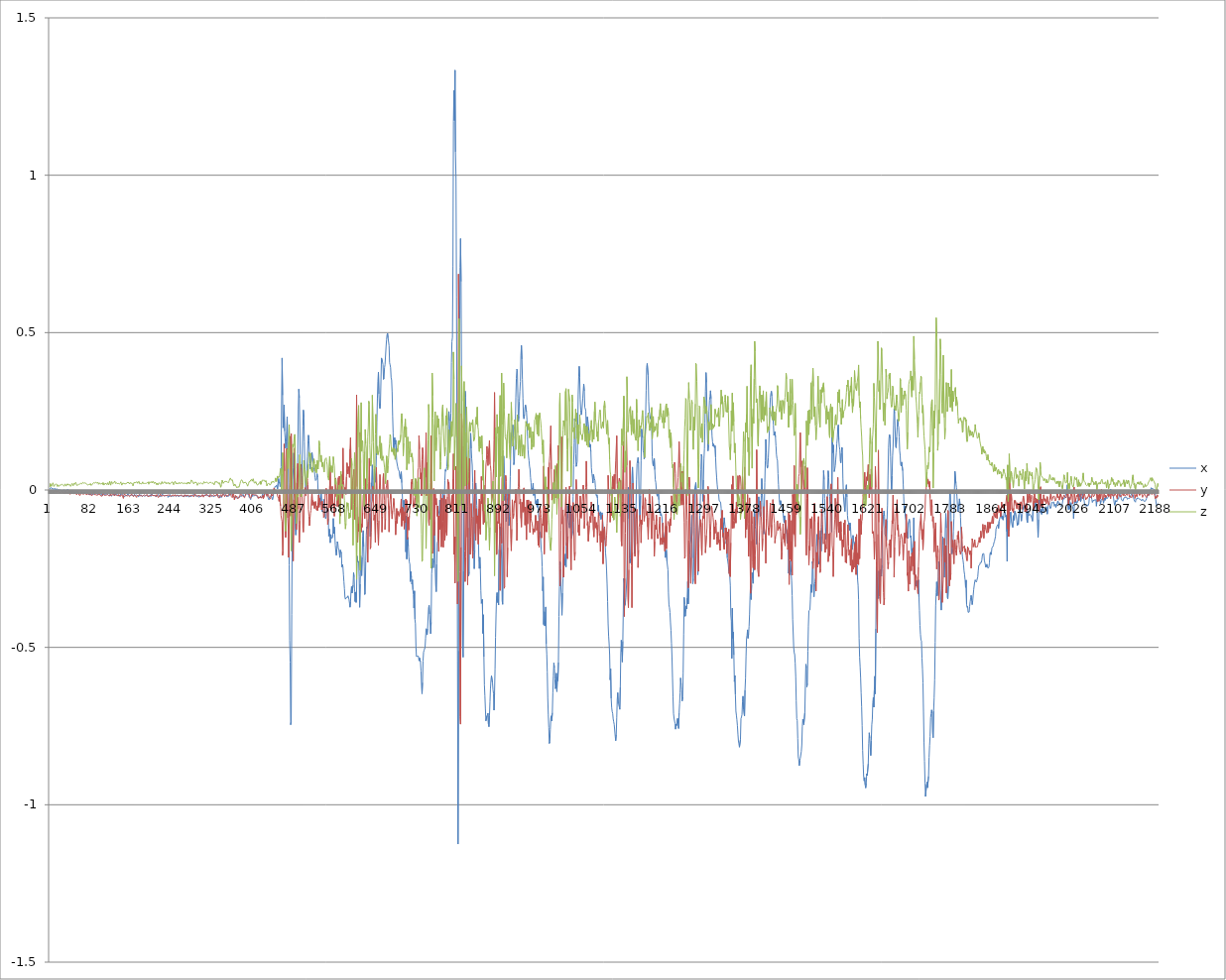
| Category | x | y | z |
|---|---|---|---|
| 0 | 0.003 | -0.001 | 0.009 |
| 1 | 0.007 | 0 | 0.02 |
| 2 | 0.005 | -0.003 | 0.019 |
| 3 | 0.007 | -0.004 | 0.012 |
| 4 | 0.007 | -0.005 | 0.015 |
| 5 | 0.003 | -0.007 | 0.018 |
| 6 | 0.004 | -0.008 | 0.023 |
| 7 | 0.004 | -0.005 | 0.022 |
| 8 | 0.002 | -0.006 | 0.011 |
| 9 | 0.003 | -0.003 | 0.013 |
| 10 | 0.004 | -0.004 | 0.017 |
| 11 | 0.005 | -0.005 | 0.017 |
| 12 | 0 | -0.002 | 0.019 |
| 13 | 0.002 | -0.006 | 0.02 |
| 14 | 0.004 | -0.006 | 0.017 |
| 15 | 0.001 | -0.005 | 0.011 |
| 16 | 0.001 | -0.008 | 0.016 |
| 17 | -0.004 | -0.005 | 0.016 |
| 18 | 0 | -0.006 | 0.012 |
| 19 | 0.001 | -0.009 | 0.013 |
| 20 | 0 | -0.007 | 0.016 |
| 21 | 0.001 | -0.008 | 0.014 |
| 22 | -0.002 | -0.009 | 0.016 |
| 23 | -0.003 | -0.005 | 0.017 |
| 24 | -0.002 | -0.003 | 0.018 |
| 25 | -0.001 | -0.007 | 0.018 |
| 26 | -0.003 | -0.009 | 0.015 |
| 27 | 0 | -0.009 | 0.014 |
| 28 | 0.001 | -0.008 | 0.012 |
| 29 | -0.001 | -0.011 | 0.013 |
| 30 | -0.008 | -0.012 | 0.019 |
| 31 | -0.007 | -0.007 | 0.02 |
| 32 | -0.002 | -0.009 | 0.012 |
| 33 | 0 | -0.008 | 0.015 |
| 34 | -0.002 | -0.008 | 0.019 |
| 35 | 0.002 | -0.009 | 0.015 |
| 36 | -0.002 | -0.009 | 0.019 |
| 37 | -0.004 | -0.009 | 0.02 |
| 38 | -0.005 | -0.009 | 0.015 |
| 39 | -0.006 | -0.008 | 0.018 |
| 40 | -0.005 | -0.014 | 0.017 |
| 41 | -0.002 | -0.012 | 0.012 |
| 42 | -0.001 | -0.009 | 0.014 |
| 43 | -0.002 | -0.009 | 0.018 |
| 44 | -0.003 | -0.006 | 0.021 |
| 45 | -0.001 | -0.005 | 0.019 |
| 46 | -0.004 | -0.008 | 0.013 |
| 47 | -0.009 | -0.012 | 0.017 |
| 48 | -0.006 | -0.013 | 0.021 |
| 49 | -0.008 | -0.011 | 0.018 |
| 50 | -0.009 | -0.01 | 0.016 |
| 51 | -0.008 | -0.011 | 0.024 |
| 52 | -0.01 | -0.012 | 0.02 |
| 53 | -0.007 | -0.015 | 0.015 |
| 54 | -0.003 | -0.012 | 0.016 |
| 55 | -0.008 | -0.01 | 0.016 |
| 56 | -0.011 | -0.01 | 0.015 |
| 57 | -0.009 | -0.013 | 0.018 |
| 58 | -0.009 | -0.016 | 0.019 |
| 59 | -0.01 | -0.014 | 0.019 |
| 60 | -0.01 | -0.017 | 0.02 |
| 61 | -0.011 | -0.012 | 0.021 |
| 62 | -0.005 | -0.007 | 0.024 |
| 63 | -0.006 | -0.01 | 0.019 |
| 64 | -0.01 | -0.011 | 0.02 |
| 65 | -0.01 | -0.013 | 0.024 |
| 66 | -0.009 | -0.015 | 0.023 |
| 67 | -0.01 | -0.014 | 0.022 |
| 68 | -0.008 | -0.011 | 0.023 |
| 69 | -0.007 | -0.011 | 0.023 |
| 70 | -0.008 | -0.012 | 0.021 |
| 71 | -0.01 | -0.015 | 0.022 |
| 72 | -0.01 | -0.014 | 0.022 |
| 73 | -0.009 | -0.015 | 0.018 |
| 74 | -0.007 | -0.014 | 0.016 |
| 75 | -0.011 | -0.011 | 0.016 |
| 76 | -0.014 | -0.013 | 0.018 |
| 77 | -0.013 | -0.014 | 0.017 |
| 78 | -0.013 | -0.015 | 0.014 |
| 79 | -0.012 | -0.015 | 0.017 |
| 80 | -0.015 | -0.013 | 0.021 |
| 81 | -0.01 | -0.014 | 0.015 |
| 82 | -0.01 | -0.018 | 0.015 |
| 83 | -0.015 | -0.017 | 0.016 |
| 84 | -0.012 | -0.017 | 0.019 |
| 85 | -0.011 | -0.013 | 0.021 |
| 86 | -0.013 | -0.011 | 0.024 |
| 87 | -0.014 | -0.01 | 0.023 |
| 88 | -0.013 | -0.012 | 0.021 |
| 89 | -0.01 | -0.015 | 0.022 |
| 90 | -0.009 | -0.012 | 0.022 |
| 91 | -0.01 | -0.015 | 0.025 |
| 92 | -0.011 | -0.015 | 0.023 |
| 93 | -0.011 | -0.017 | 0.022 |
| 94 | -0.015 | -0.014 | 0.024 |
| 95 | -0.013 | -0.015 | 0.024 |
| 96 | -0.01 | -0.018 | 0.018 |
| 97 | -0.011 | -0.014 | 0.018 |
| 98 | -0.012 | -0.013 | 0.023 |
| 99 | -0.01 | -0.015 | 0.02 |
| 100 | -0.013 | -0.014 | 0.018 |
| 101 | -0.015 | -0.02 | 0.018 |
| 102 | -0.013 | -0.018 | 0.022 |
| 103 | -0.016 | -0.019 | 0.021 |
| 104 | -0.019 | -0.016 | 0.018 |
| 105 | -0.016 | -0.011 | 0.023 |
| 106 | -0.011 | -0.014 | 0.017 |
| 107 | -0.013 | -0.014 | 0.014 |
| 108 | -0.015 | -0.017 | 0.017 |
| 109 | -0.016 | -0.016 | 0.022 |
| 110 | -0.014 | -0.017 | 0.024 |
| 111 | -0.014 | -0.018 | 0.02 |
| 112 | -0.013 | -0.016 | 0.018 |
| 113 | -0.016 | -0.013 | 0.017 |
| 114 | -0.014 | -0.015 | 0.023 |
| 115 | -0.012 | -0.016 | 0.019 |
| 116 | -0.017 | -0.018 | 0.016 |
| 117 | -0.019 | -0.02 | 0.019 |
| 118 | -0.018 | -0.019 | 0.028 |
| 119 | -0.014 | -0.015 | 0.021 |
| 120 | -0.015 | -0.011 | 0.015 |
| 121 | -0.02 | -0.018 | 0.018 |
| 122 | -0.017 | -0.02 | 0.027 |
| 123 | -0.018 | -0.014 | 0.024 |
| 124 | -0.017 | -0.011 | 0.02 |
| 125 | -0.014 | -0.011 | 0.02 |
| 126 | -0.012 | -0.015 | 0.023 |
| 127 | -0.012 | -0.019 | 0.024 |
| 128 | -0.016 | -0.019 | 0.028 |
| 129 | -0.015 | -0.014 | 0.024 |
| 130 | -0.015 | -0.015 | 0.02 |
| 131 | -0.016 | -0.017 | 0.024 |
| 132 | -0.014 | -0.016 | 0.026 |
| 133 | -0.013 | -0.017 | 0.02 |
| 134 | -0.016 | -0.019 | 0.019 |
| 135 | -0.018 | -0.019 | 0.021 |
| 136 | -0.016 | -0.014 | 0.023 |
| 137 | -0.015 | -0.012 | 0.019 |
| 138 | -0.02 | -0.018 | 0.018 |
| 139 | -0.018 | -0.019 | 0.022 |
| 140 | -0.012 | -0.019 | 0.026 |
| 141 | -0.013 | -0.015 | 0.019 |
| 142 | -0.012 | -0.015 | 0.015 |
| 143 | -0.012 | -0.017 | 0.019 |
| 144 | -0.014 | -0.022 | 0.022 |
| 145 | -0.017 | -0.027 | 0.021 |
| 146 | -0.022 | -0.018 | 0.021 |
| 147 | -0.019 | -0.012 | 0.018 |
| 148 | -0.02 | -0.011 | 0.02 |
| 149 | -0.017 | -0.017 | 0.021 |
| 150 | -0.017 | -0.019 | 0.02 |
| 151 | -0.016 | -0.017 | 0.021 |
| 152 | -0.018 | -0.015 | 0.022 |
| 153 | -0.015 | -0.019 | 0.023 |
| 154 | -0.012 | -0.019 | 0.025 |
| 155 | -0.013 | -0.016 | 0.024 |
| 156 | -0.015 | -0.016 | 0.022 |
| 157 | -0.016 | -0.021 | 0.019 |
| 158 | -0.018 | -0.02 | 0.024 |
| 159 | -0.016 | -0.018 | 0.022 |
| 160 | -0.016 | -0.016 | 0.022 |
| 161 | -0.018 | -0.013 | 0.022 |
| 162 | -0.016 | -0.014 | 0.022 |
| 163 | -0.015 | -0.018 | 0.017 |
| 164 | -0.016 | -0.021 | 0.013 |
| 165 | -0.021 | -0.021 | 0.019 |
| 166 | -0.018 | -0.019 | 0.024 |
| 167 | -0.014 | -0.015 | 0.023 |
| 168 | -0.014 | -0.013 | 0.023 |
| 169 | -0.018 | -0.019 | 0.023 |
| 170 | -0.018 | -0.021 | 0.025 |
| 171 | -0.016 | -0.023 | 0.026 |
| 172 | -0.015 | -0.018 | 0.026 |
| 173 | -0.018 | -0.015 | 0.021 |
| 174 | -0.017 | -0.018 | 0.026 |
| 175 | -0.022 | -0.016 | 0.025 |
| 176 | -0.02 | -0.015 | 0.027 |
| 177 | -0.014 | -0.015 | 0.02 |
| 178 | -0.017 | -0.018 | 0.02 |
| 179 | -0.02 | -0.019 | 0.021 |
| 180 | -0.016 | -0.017 | 0.02 |
| 181 | -0.018 | -0.015 | 0.019 |
| 182 | -0.021 | -0.02 | 0.021 |
| 183 | -0.018 | -0.019 | 0.026 |
| 184 | -0.017 | -0.018 | 0.021 |
| 185 | -0.018 | -0.017 | 0.018 |
| 186 | -0.019 | -0.015 | 0.021 |
| 187 | -0.02 | -0.016 | 0.022 |
| 188 | -0.019 | -0.018 | 0.021 |
| 189 | -0.017 | -0.018 | 0.023 |
| 190 | -0.016 | -0.017 | 0.021 |
| 191 | -0.018 | -0.015 | 0.019 |
| 192 | -0.019 | -0.014 | 0.023 |
| 193 | -0.019 | -0.02 | 0.023 |
| 194 | -0.019 | -0.019 | 0.025 |
| 195 | -0.017 | -0.021 | 0.018 |
| 196 | -0.018 | -0.019 | 0.02 |
| 197 | -0.015 | -0.018 | 0.026 |
| 198 | -0.015 | -0.016 | 0.024 |
| 199 | -0.021 | -0.016 | 0.023 |
| 200 | -0.017 | -0.016 | 0.026 |
| 201 | -0.013 | -0.015 | 0.027 |
| 202 | -0.016 | -0.015 | 0.022 |
| 203 | -0.018 | -0.017 | 0.025 |
| 204 | -0.018 | -0.015 | 0.027 |
| 205 | -0.018 | -0.018 | 0.027 |
| 206 | -0.017 | -0.018 | 0.021 |
| 207 | -0.018 | -0.018 | 0.024 |
| 208 | -0.017 | -0.019 | 0.027 |
| 209 | -0.016 | -0.021 | 0.023 |
| 210 | -0.022 | -0.021 | 0.017 |
| 211 | -0.02 | -0.014 | 0.022 |
| 212 | -0.017 | -0.016 | 0.021 |
| 213 | -0.017 | -0.021 | 0.016 |
| 214 | -0.014 | -0.024 | 0.017 |
| 215 | -0.018 | -0.022 | 0.023 |
| 216 | -0.02 | -0.019 | 0.022 |
| 217 | -0.022 | -0.017 | 0.02 |
| 218 | -0.017 | -0.013 | 0.02 |
| 219 | -0.017 | -0.014 | 0.018 |
| 220 | -0.02 | -0.02 | 0.022 |
| 221 | -0.017 | -0.022 | 0.027 |
| 222 | -0.013 | -0.018 | 0.021 |
| 223 | -0.014 | -0.018 | 0.018 |
| 224 | -0.017 | -0.017 | 0.021 |
| 225 | -0.02 | -0.018 | 0.023 |
| 226 | -0.018 | -0.019 | 0.026 |
| 227 | -0.018 | -0.018 | 0.025 |
| 228 | -0.018 | -0.017 | 0.023 |
| 229 | -0.018 | -0.02 | 0.02 |
| 230 | -0.017 | -0.018 | 0.024 |
| 231 | -0.014 | -0.015 | 0.027 |
| 232 | -0.017 | -0.017 | 0.02 |
| 233 | -0.023 | -0.018 | 0.019 |
| 234 | -0.02 | -0.016 | 0.024 |
| 235 | -0.019 | -0.015 | 0.024 |
| 236 | -0.021 | -0.017 | 0.018 |
| 237 | -0.014 | -0.018 | 0.019 |
| 238 | -0.015 | -0.019 | 0.021 |
| 239 | -0.021 | -0.02 | 0.021 |
| 240 | -0.019 | -0.019 | 0.024 |
| 241 | -0.019 | -0.017 | 0.027 |
| 242 | -0.021 | -0.015 | 0.026 |
| 243 | -0.019 | -0.018 | 0.022 |
| 244 | -0.017 | -0.017 | 0.017 |
| 245 | -0.018 | -0.018 | 0.021 |
| 246 | -0.018 | -0.02 | 0.024 |
| 247 | -0.018 | -0.015 | 0.028 |
| 248 | -0.016 | -0.012 | 0.027 |
| 249 | -0.021 | -0.019 | 0.019 |
| 250 | -0.02 | -0.019 | 0.023 |
| 251 | -0.016 | -0.018 | 0.025 |
| 252 | -0.013 | -0.018 | 0.02 |
| 253 | -0.017 | -0.018 | 0.019 |
| 254 | -0.022 | -0.02 | 0.021 |
| 255 | -0.021 | -0.018 | 0.025 |
| 256 | -0.018 | -0.019 | 0.02 |
| 257 | -0.02 | -0.018 | 0.018 |
| 258 | -0.019 | -0.015 | 0.022 |
| 259 | -0.02 | -0.016 | 0.022 |
| 260 | -0.018 | -0.018 | 0.024 |
| 261 | -0.017 | -0.017 | 0.027 |
| 262 | -0.019 | -0.018 | 0.021 |
| 263 | -0.02 | -0.022 | 0.019 |
| 264 | -0.022 | -0.023 | 0.022 |
| 265 | -0.016 | -0.019 | 0.024 |
| 266 | -0.015 | -0.015 | 0.021 |
| 267 | -0.02 | -0.017 | 0.02 |
| 268 | -0.019 | -0.02 | 0.021 |
| 269 | -0.015 | -0.017 | 0.02 |
| 270 | -0.021 | -0.018 | 0.019 |
| 271 | -0.023 | -0.018 | 0.022 |
| 272 | -0.016 | -0.017 | 0.025 |
| 273 | -0.016 | -0.016 | 0.021 |
| 274 | -0.023 | -0.019 | 0.025 |
| 275 | -0.018 | -0.021 | 0.024 |
| 276 | -0.017 | -0.019 | 0.019 |
| 277 | -0.018 | -0.02 | 0.021 |
| 278 | -0.019 | -0.017 | 0.026 |
| 279 | -0.021 | -0.016 | 0.032 |
| 280 | -0.021 | -0.013 | 0.032 |
| 281 | -0.017 | -0.017 | 0.029 |
| 282 | -0.014 | -0.017 | 0.023 |
| 283 | -0.015 | -0.018 | 0.023 |
| 284 | -0.016 | -0.022 | 0.019 |
| 285 | -0.016 | -0.02 | 0.025 |
| 286 | -0.017 | -0.012 | 0.027 |
| 287 | -0.019 | -0.01 | 0.024 |
| 288 | -0.019 | -0.017 | 0.021 |
| 289 | -0.019 | -0.017 | 0.024 |
| 290 | -0.018 | -0.019 | 0.02 |
| 291 | -0.018 | -0.021 | 0.015 |
| 292 | -0.02 | -0.02 | 0.019 |
| 293 | -0.021 | -0.016 | 0.021 |
| 294 | -0.021 | -0.015 | 0.023 |
| 295 | -0.023 | -0.019 | 0.022 |
| 296 | -0.019 | -0.018 | 0.02 |
| 297 | -0.019 | -0.019 | 0.019 |
| 298 | -0.019 | -0.019 | 0.023 |
| 299 | -0.017 | -0.021 | 0.023 |
| 300 | -0.018 | -0.021 | 0.02 |
| 301 | -0.02 | -0.014 | 0.021 |
| 302 | -0.017 | -0.018 | 0.019 |
| 303 | -0.016 | -0.023 | 0.018 |
| 304 | -0.019 | -0.017 | 0.027 |
| 305 | -0.019 | -0.016 | 0.026 |
| 306 | -0.015 | -0.017 | 0.022 |
| 307 | -0.015 | -0.02 | 0.023 |
| 308 | -0.017 | -0.017 | 0.024 |
| 309 | -0.015 | -0.012 | 0.026 |
| 310 | -0.018 | -0.014 | 0.025 |
| 311 | -0.021 | -0.016 | 0.024 |
| 312 | -0.018 | -0.017 | 0.022 |
| 313 | -0.016 | -0.02 | 0.019 |
| 314 | -0.018 | -0.02 | 0.021 |
| 315 | -0.02 | -0.022 | 0.023 |
| 316 | -0.022 | -0.014 | 0.025 |
| 317 | -0.019 | -0.013 | 0.022 |
| 318 | -0.017 | -0.016 | 0.024 |
| 319 | -0.017 | -0.019 | 0.025 |
| 320 | -0.016 | -0.021 | 0.021 |
| 321 | -0.019 | -0.021 | 0.023 |
| 322 | -0.02 | -0.017 | 0.023 |
| 323 | -0.022 | -0.017 | 0.022 |
| 324 | -0.021 | -0.015 | 0.016 |
| 325 | -0.022 | -0.018 | 0.02 |
| 326 | -0.018 | -0.019 | 0.027 |
| 327 | -0.015 | -0.02 | 0.028 |
| 328 | -0.014 | -0.018 | 0.025 |
| 329 | -0.017 | -0.016 | 0.027 |
| 330 | -0.017 | -0.011 | 0.026 |
| 331 | -0.02 | -0.016 | 0.023 |
| 332 | -0.019 | -0.024 | 0.021 |
| 333 | -0.017 | -0.026 | 0.02 |
| 334 | -0.021 | -0.025 | 0.024 |
| 335 | -0.026 | -0.02 | 0.027 |
| 336 | -0.019 | -0.016 | 0.015 |
| 337 | -0.019 | -0.016 | 0.009 |
| 338 | -0.024 | -0.016 | 0.015 |
| 339 | -0.023 | -0.022 | 0.027 |
| 340 | -0.017 | -0.019 | 0.032 |
| 341 | -0.014 | -0.007 | 0.03 |
| 342 | -0.015 | -0.013 | 0.021 |
| 343 | -0.016 | -0.015 | 0.024 |
| 344 | -0.015 | -0.017 | 0.026 |
| 345 | -0.014 | -0.021 | 0.025 |
| 346 | -0.016 | -0.016 | 0.027 |
| 347 | -0.016 | -0.013 | 0.026 |
| 348 | -0.017 | -0.015 | 0.027 |
| 349 | -0.022 | -0.017 | 0.024 |
| 350 | -0.018 | -0.019 | 0.026 |
| 351 | -0.017 | -0.018 | 0.025 |
| 352 | -0.019 | -0.018 | 0.023 |
| 353 | -0.021 | -0.019 | 0.027 |
| 354 | -0.018 | -0.01 | 0.031 |
| 355 | -0.011 | -0.005 | 0.032 |
| 356 | -0.005 | -0.007 | 0.038 |
| 357 | -0.008 | -0.016 | 0.035 |
| 358 | -0.011 | -0.02 | 0.031 |
| 359 | -0.014 | -0.019 | 0.03 |
| 360 | -0.015 | -0.024 | 0.032 |
| 361 | -0.02 | -0.008 | 0.031 |
| 362 | -0.019 | -0.005 | 0.018 |
| 363 | -0.021 | -0.022 | 0.013 |
| 364 | -0.023 | -0.031 | 0.014 |
| 365 | -0.027 | -0.022 | 0.019 |
| 366 | -0.022 | -0.017 | 0.016 |
| 367 | -0.022 | -0.023 | 0.013 |
| 368 | -0.024 | -0.021 | 0.012 |
| 369 | -0.027 | -0.02 | 0.007 |
| 370 | -0.026 | -0.027 | 0.009 |
| 371 | -0.025 | -0.026 | 0.011 |
| 372 | -0.025 | -0.026 | 0.012 |
| 373 | -0.022 | -0.026 | 0.009 |
| 374 | -0.02 | -0.024 | 0.012 |
| 375 | -0.017 | -0.017 | 0.02 |
| 376 | -0.017 | -0.009 | 0.027 |
| 377 | -0.021 | -0.011 | 0.03 |
| 378 | -0.018 | -0.017 | 0.032 |
| 379 | -0.018 | -0.018 | 0.031 |
| 380 | -0.018 | -0.018 | 0.029 |
| 381 | -0.014 | -0.019 | 0.022 |
| 382 | -0.015 | -0.022 | 0.023 |
| 383 | -0.022 | -0.023 | 0.023 |
| 384 | -0.02 | -0.024 | 0.021 |
| 385 | -0.018 | -0.02 | 0.025 |
| 386 | -0.017 | -0.013 | 0.025 |
| 387 | -0.013 | -0.012 | 0.023 |
| 388 | -0.005 | -0.012 | 0.023 |
| 389 | -0.008 | -0.008 | 0.017 |
| 390 | -0.013 | -0.007 | 0.012 |
| 391 | -0.015 | -0.014 | 0.011 |
| 392 | -0.017 | -0.013 | 0.021 |
| 393 | -0.023 | -0.011 | 0.026 |
| 394 | -0.025 | -0.019 | 0.027 |
| 395 | -0.026 | -0.026 | 0.027 |
| 396 | -0.03 | -0.029 | 0.032 |
| 397 | -0.029 | -0.024 | 0.034 |
| 398 | -0.018 | -0.014 | 0.034 |
| 399 | -0.014 | -0.013 | 0.028 |
| 400 | -0.021 | -0.014 | 0.032 |
| 401 | -0.022 | -0.013 | 0.036 |
| 402 | -0.017 | -0.014 | 0.033 |
| 403 | -0.018 | -0.011 | 0.023 |
| 404 | -0.018 | -0.016 | 0.02 |
| 405 | -0.016 | -0.017 | 0.023 |
| 406 | -0.016 | -0.016 | 0.027 |
| 407 | -0.018 | -0.017 | 0.024 |
| 408 | -0.018 | -0.016 | 0.018 |
| 409 | -0.021 | -0.016 | 0.018 |
| 410 | -0.024 | -0.019 | 0.015 |
| 411 | -0.024 | -0.027 | 0.015 |
| 412 | -0.025 | -0.023 | 0.021 |
| 413 | -0.026 | -0.022 | 0.023 |
| 414 | -0.024 | -0.025 | 0.023 |
| 415 | -0.021 | -0.02 | 0.028 |
| 416 | -0.023 | -0.022 | 0.018 |
| 417 | -0.024 | -0.026 | 0.019 |
| 418 | -0.024 | -0.026 | 0.028 |
| 419 | -0.015 | -0.022 | 0.031 |
| 420 | -0.012 | -0.017 | 0.03 |
| 421 | -0.023 | -0.028 | 0.031 |
| 422 | -0.023 | -0.029 | 0.031 |
| 423 | -0.016 | -0.016 | 0.031 |
| 424 | -0.014 | -0.004 | 0.03 |
| 425 | -0.01 | -0.001 | 0.025 |
| 426 | -0.006 | -0.005 | 0.03 |
| 427 | -0.005 | -0.016 | 0.025 |
| 428 | -0.005 | -0.02 | 0.013 |
| 429 | -0.013 | -0.01 | 0.018 |
| 430 | -0.023 | -0.011 | 0.021 |
| 431 | -0.028 | -0.015 | 0.021 |
| 432 | -0.031 | -0.022 | 0.022 |
| 433 | -0.028 | -0.022 | 0.02 |
| 434 | -0.024 | -0.025 | 0.015 |
| 435 | -0.022 | -0.029 | 0.014 |
| 436 | -0.018 | -0.023 | 0.019 |
| 437 | -0.018 | -0.011 | 0.026 |
| 438 | -0.023 | -0.009 | 0.023 |
| 439 | -0.031 | -0.019 | 0.025 |
| 440 | -0.027 | -0.015 | 0.028 |
| 441 | -0.013 | -0.003 | 0.028 |
| 442 | -0.001 | 0.007 | 0.024 |
| 443 | 0.005 | 0.004 | 0.022 |
| 444 | 0.011 | 0 | 0.027 |
| 445 | 0.013 | -0.005 | 0.038 |
| 446 | 0.011 | -0.007 | 0.037 |
| 447 | 0.015 | -0.003 | 0.027 |
| 448 | 0.012 | -0.007 | 0.03 |
| 449 | 0.003 | -0.019 | 0.044 |
| 450 | 0.021 | -0.019 | 0.038 |
| 451 | 0.036 | -0.027 | 0.038 |
| 452 | 0.021 | -0.036 | 0.041 |
| 453 | 0.025 | -0.015 | 0.044 |
| 454 | 0.011 | -0.018 | 0.057 |
| 455 | 0.014 | -0.051 | 0.068 |
| 456 | 0.075 | -0.081 | 0.048 |
| 457 | 0.271 | -0.092 | -0.002 |
| 458 | 0.419 | -0.1 | 0.053 |
| 459 | 0.301 | -0.208 | 0.119 |
| 460 | 0.198 | -0.194 | 0.073 |
| 461 | 0.232 | -0.004 | -0.015 |
| 462 | 0.27 | 0.146 | -0.047 |
| 463 | 0.187 | 0.06 | -0.062 |
| 464 | 0.164 | -0.112 | -0.107 |
| 465 | 0.133 | -0.151 | -0.131 |
| 466 | 0.153 | -0.105 | -0.058 |
| 467 | 0.188 | 0.132 | 0.015 |
| 468 | 0.233 | 0.131 | 0.129 |
| 469 | 0.13 | -0.089 | 0.111 |
| 470 | 0.102 | -0.117 | 0.068 |
| 471 | 0.002 | -0.214 | 0.152 |
| 472 | -0.239 | -0.076 | 0.208 |
| 473 | -0.478 | 0.024 | 0.101 |
| 474 | -0.547 | 0.171 | 0.012 |
| 475 | -0.746 | -0.083 | 0.015 |
| 476 | -0.736 | 0.179 | -0.194 |
| 477 | -0.396 | 0.08 | -0.083 |
| 478 | -0.125 | -0.077 | 0.062 |
| 479 | 0.032 | -0.099 | 0.145 |
| 480 | 0.07 | -0.226 | 0.137 |
| 481 | 0.118 | -0.03 | 0.147 |
| 482 | 0.047 | -0.001 | 0.172 |
| 483 | -0.009 | 0.134 | 0.177 |
| 484 | -0.126 | -0.064 | 0.069 |
| 485 | -0.143 | -0.037 | -0.058 |
| 486 | -0.126 | -0.126 | -0.107 |
| 487 | -0.089 | 0.023 | -0.06 |
| 488 | -0.029 | 0.023 | -0.015 |
| 489 | 0.115 | 0.084 | -0.022 |
| 490 | 0.255 | -0.06 | -0.018 |
| 491 | 0.321 | -0.109 | 0.009 |
| 492 | 0.293 | -0.167 | 0.083 |
| 493 | 0.202 | -0.098 | 0.112 |
| 494 | 0.064 | -0.009 | 0.069 |
| 495 | 0.002 | 0.082 | 0.021 |
| 496 | 0 | 0.064 | -0.022 |
| 497 | 0.045 | 0.023 | -0.007 |
| 498 | 0.129 | -0.058 | -0.004 |
| 499 | 0.204 | -0.121 | 0.004 |
| 500 | 0.254 | -0.134 | 0.053 |
| 501 | 0.231 | -0.063 | 0.094 |
| 502 | 0.153 | -0.023 | 0.095 |
| 503 | 0.065 | 0.007 | 0.045 |
| 504 | 0.007 | -0.002 | 0.025 |
| 505 | -0.019 | -0.019 | 0.018 |
| 506 | 0.004 | 0.001 | 0.014 |
| 507 | 0.069 | 0.041 | 0.061 |
| 508 | 0.105 | 0.031 | 0.063 |
| 509 | 0.148 | 0.016 | 0.04 |
| 510 | 0.174 | -0.061 | 0.083 |
| 511 | 0.156 | -0.084 | 0.12 |
| 512 | 0.12 | -0.113 | 0.107 |
| 513 | 0.084 | -0.093 | 0.108 |
| 514 | 0.067 | -0.074 | 0.117 |
| 515 | 0.077 | -0.065 | 0.082 |
| 516 | 0.104 | -0.026 | 0.062 |
| 517 | 0.12 | -0.009 | 0.071 |
| 518 | 0.122 | -0.049 | 0.056 |
| 519 | 0.083 | -0.034 | 0.054 |
| 520 | 0.072 | -0.047 | 0.092 |
| 521 | 0.064 | -0.039 | 0.099 |
| 522 | 0.058 | -0.058 | 0.085 |
| 523 | 0.04 | -0.059 | 0.059 |
| 524 | 0.03 | -0.037 | 0.081 |
| 525 | 0.029 | -0.05 | 0.072 |
| 526 | 0.034 | -0.064 | 0.054 |
| 527 | 0.052 | -0.052 | 0.094 |
| 528 | 0.04 | -0.066 | 0.094 |
| 529 | -0.004 | -0.039 | 0.066 |
| 530 | -0.001 | -0.016 | 0.095 |
| 531 | -0.003 | -0.055 | 0.156 |
| 532 | -0.037 | -0.027 | 0.142 |
| 533 | -0.048 | -0.036 | 0.112 |
| 534 | -0.035 | -0.038 | 0.09 |
| 535 | -0.009 | -0.041 | 0.111 |
| 536 | -0.039 | -0.063 | 0.109 |
| 537 | -0.069 | -0.035 | 0.074 |
| 538 | -0.06 | -0.049 | 0.088 |
| 539 | -0.051 | -0.053 | 0.077 |
| 540 | -0.03 | -0.087 | 0.066 |
| 541 | -0.036 | -0.084 | 0.057 |
| 542 | -0.065 | -0.065 | 0.091 |
| 543 | -0.087 | -0.011 | 0.098 |
| 544 | -0.091 | -0.008 | 0.099 |
| 545 | -0.084 | 0.005 | 0.102 |
| 546 | -0.05 | -0.018 | 0.09 |
| 547 | -0.071 | -0.071 | 0.079 |
| 548 | -0.059 | -0.109 | 0.044 |
| 549 | -0.068 | -0.092 | 0.047 |
| 550 | -0.147 | -0.005 | 0.031 |
| 551 | -0.124 | -0.056 | 0.034 |
| 552 | -0.137 | 0.015 | 0.107 |
| 553 | -0.168 | 0.072 | 0.075 |
| 554 | -0.141 | -0.052 | 0.057 |
| 555 | -0.146 | -0.066 | 0.077 |
| 556 | -0.154 | -0.012 | 0.064 |
| 557 | -0.156 | 0.011 | 0.055 |
| 558 | -0.15 | -0.048 | 0.068 |
| 559 | -0.09 | -0.042 | 0.106 |
| 560 | -0.138 | -0.052 | 0.089 |
| 561 | -0.118 | -0.083 | 0.076 |
| 562 | -0.142 | -0.023 | 0.04 |
| 563 | -0.175 | 0.038 | 0.018 |
| 564 | -0.196 | -0.002 | 0.035 |
| 565 | -0.207 | -0.021 | 0.017 |
| 566 | -0.188 | 0.003 | -0.033 |
| 567 | -0.164 | -0.052 | -0.019 |
| 568 | -0.17 | 0.004 | -0.006 |
| 569 | -0.186 | 0.039 | -0.016 |
| 570 | -0.19 | -0.051 | 0.016 |
| 571 | -0.191 | 0.044 | -0.002 |
| 572 | -0.215 | 0.033 | -0.108 |
| 573 | -0.191 | -0.083 | 0.022 |
| 574 | -0.19 | 0.002 | 0.06 |
| 575 | -0.201 | 0.018 | 0.021 |
| 576 | -0.245 | 0.048 | 0.012 |
| 577 | -0.237 | -0.026 | 0.017 |
| 578 | -0.244 | 0.133 | 0.001 |
| 579 | -0.269 | 0.031 | -0.006 |
| 580 | -0.291 | 0.015 | -0.011 |
| 581 | -0.314 | -0.005 | -0.034 |
| 582 | -0.341 | 0.008 | -0.103 |
| 583 | -0.347 | -0.009 | -0.124 |
| 584 | -0.349 | -0.014 | -0.107 |
| 585 | -0.341 | 0.042 | -0.062 |
| 586 | -0.34 | 0.086 | -0.04 |
| 587 | -0.341 | 0.069 | -0.051 |
| 588 | -0.336 | 0.051 | -0.042 |
| 589 | -0.338 | 0.074 | -0.068 |
| 590 | -0.347 | 0.06 | -0.091 |
| 591 | -0.36 | 0.04 | -0.074 |
| 592 | -0.372 | 0.131 | -0.088 |
| 593 | -0.354 | 0.166 | -0.077 |
| 594 | -0.322 | 0.07 | 0.005 |
| 595 | -0.307 | 0.012 | 0.1 |
| 596 | -0.327 | -0.062 | 0.078 |
| 597 | -0.329 | 0.031 | -0.089 |
| 598 | -0.302 | 0.043 | -0.176 |
| 599 | -0.262 | 0.05 | -0.046 |
| 600 | -0.276 | 0.066 | 0.046 |
| 601 | -0.323 | -0.04 | 0.119 |
| 602 | -0.354 | -0.094 | 0.075 |
| 603 | -0.324 | 0.009 | -0.08 |
| 604 | -0.357 | 0.129 | -0.158 |
| 605 | -0.316 | 0.302 | -0.284 |
| 606 | -0.21 | 0.01 | -0.054 |
| 607 | -0.228 | -0.167 | 0.209 |
| 608 | -0.228 | -0.107 | 0.236 |
| 609 | -0.226 | -0.131 | 0.269 |
| 610 | -0.275 | -0.084 | 0.136 |
| 611 | -0.373 | -0.011 | -0.224 |
| 612 | -0.299 | 0.183 | -0.255 |
| 613 | -0.209 | 0.087 | 0.171 |
| 614 | -0.247 | -0.134 | 0.278 |
| 615 | -0.272 | -0.108 | 0.123 |
| 616 | -0.213 | -0.118 | 0.157 |
| 617 | -0.146 | -0.072 | 0.153 |
| 618 | -0.129 | -0.016 | 0.115 |
| 619 | -0.18 | -0.013 | 0.011 |
| 620 | -0.243 | -0.024 | -0.053 |
| 621 | -0.332 | -0.091 | 0.122 |
| 622 | -0.326 | -0.046 | 0.192 |
| 623 | -0.225 | 0.036 | 0.148 |
| 624 | -0.143 | 0.003 | 0.132 |
| 625 | -0.117 | -0.064 | -0.005 |
| 626 | -0.122 | -0.181 | 0.02 |
| 627 | -0.112 | -0.23 | 0.169 |
| 628 | -0.094 | -0.1 | 0.201 |
| 629 | -0.096 | 0.028 | 0.282 |
| 630 | -0.09 | 0.101 | 0.273 |
| 631 | -0.074 | -0.039 | 0.143 |
| 632 | -0.148 | -0.187 | 0.095 |
| 633 | -0.088 | -0.181 | 0.076 |
| 634 | 0.023 | -0.133 | 0.094 |
| 635 | 0.012 | -0.041 | 0.15 |
| 636 | 0.08 | -0.035 | 0.301 |
| 637 | 0.032 | 0.012 | 0.298 |
| 638 | -0.019 | -0.018 | 0.154 |
| 639 | 0.015 | -0.096 | 0.085 |
| 640 | 0.066 | -0.097 | 0.002 |
| 641 | 0.047 | -0.079 | 0.076 |
| 642 | 0.025 | -0.167 | 0.178 |
| 643 | 0.052 | -0.014 | 0.241 |
| 644 | 0.109 | 0.071 | 0.189 |
| 645 | 0.216 | -0.011 | 0.116 |
| 646 | 0.293 | -0.103 | 0.139 |
| 647 | 0.346 | -0.143 | 0.112 |
| 648 | 0.374 | -0.176 | 0.109 |
| 649 | 0.305 | -0.098 | 0.125 |
| 650 | 0.265 | 0.013 | 0.146 |
| 651 | 0.259 | 0.049 | 0.171 |
| 652 | 0.277 | 0.013 | 0.1 |
| 653 | 0.35 | -0.04 | 0.119 |
| 654 | 0.419 | -0.069 | 0.149 |
| 655 | 0.421 | -0.134 | 0.094 |
| 656 | 0.407 | -0.084 | 0.105 |
| 657 | 0.399 | 0.036 | 0.108 |
| 658 | 0.352 | 0.052 | 0.1 |
| 659 | 0.355 | -0.006 | 0.097 |
| 660 | 0.389 | -0.032 | 0.072 |
| 661 | 0.398 | -0.126 | 0.056 |
| 662 | 0.396 | -0.09 | 0.02 |
| 663 | 0.454 | 0.006 | 0.019 |
| 664 | 0.477 | 0.013 | 0.108 |
| 665 | 0.493 | 0.027 | 0.103 |
| 666 | 0.497 | 0.032 | 0.054 |
| 667 | 0.483 | -0.025 | 0.076 |
| 668 | 0.484 | -0.064 | 0.102 |
| 669 | 0.458 | -0.133 | 0.129 |
| 670 | 0.405 | -0.051 | 0.147 |
| 671 | 0.398 | -0.053 | 0.176 |
| 672 | 0.388 | -0.009 | 0.17 |
| 673 | 0.357 | -0.028 | 0.142 |
| 674 | 0.35 | -0.077 | 0.122 |
| 675 | 0.312 | -0.092 | 0.128 |
| 676 | 0.236 | -0.065 | 0.122 |
| 677 | 0.18 | -0.054 | 0.134 |
| 678 | 0.121 | -0.027 | 0.114 |
| 679 | 0.15 | -0.034 | 0.109 |
| 680 | 0.167 | -0.07 | 0.131 |
| 681 | 0.146 | -0.096 | 0.097 |
| 682 | 0.158 | -0.142 | 0.107 |
| 683 | 0.123 | -0.096 | 0.114 |
| 684 | 0.091 | -0.059 | 0.122 |
| 685 | 0.082 | -0.105 | 0.132 |
| 686 | 0.074 | -0.067 | 0.122 |
| 687 | 0.065 | -0.079 | 0.154 |
| 688 | 0.062 | -0.076 | 0.157 |
| 689 | 0.06 | -0.083 | 0.144 |
| 690 | 0.043 | -0.07 | 0.157 |
| 691 | 0.036 | -0.061 | 0.154 |
| 692 | 0.05 | -0.072 | 0.175 |
| 693 | 0.058 | -0.028 | 0.229 |
| 694 | 0.023 | -0.115 | 0.243 |
| 695 | -0.012 | -0.055 | 0.211 |
| 696 | -0.05 | -0.097 | 0.179 |
| 697 | -0.079 | -0.056 | 0.109 |
| 698 | -0.033 | -0.095 | 0.148 |
| 699 | -0.048 | -0.124 | 0.201 |
| 700 | -0.068 | -0.069 | 0.192 |
| 701 | -0.073 | -0.104 | 0.225 |
| 702 | -0.197 | -0.029 | 0.167 |
| 703 | -0.083 | -0.053 | 0.199 |
| 704 | -0.219 | -0.034 | 0.064 |
| 705 | -0.163 | -0.157 | 0.081 |
| 706 | -0.151 | -0.086 | 0.168 |
| 707 | -0.179 | -0.109 | 0.131 |
| 708 | -0.212 | -0.127 | 0.084 |
| 709 | -0.23 | -0.081 | 0.125 |
| 710 | -0.236 | -0.069 | 0.154 |
| 711 | -0.291 | -0.011 | 0.122 |
| 712 | -0.259 | -0.045 | 0.104 |
| 713 | -0.278 | 0.025 | 0.113 |
| 714 | -0.299 | 0.034 | 0.117 |
| 715 | -0.285 | 0.018 | 0.118 |
| 716 | -0.317 | -0.032 | 0.087 |
| 717 | -0.332 | -0.055 | 0.03 |
| 718 | -0.375 | -0.043 | -0.016 |
| 719 | -0.321 | -0.052 | 0.004 |
| 720 | -0.411 | -0.024 | -0.018 |
| 721 | -0.425 | 0.008 | 0.036 |
| 722 | -0.498 | 0.034 | 0.004 |
| 723 | -0.529 | 0.022 | -0.053 |
| 724 | -0.527 | -0.046 | -0.082 |
| 725 | -0.528 | -0.034 | -0.002 |
| 726 | -0.526 | 0.063 | 0.03 |
| 727 | -0.528 | 0.07 | 0.039 |
| 728 | -0.543 | 0.173 | -0.057 |
| 729 | -0.533 | 0.13 | -0.054 |
| 730 | -0.531 | 0.071 | -0.052 |
| 731 | -0.546 | 0.035 | -0.048 |
| 732 | -0.575 | 0.054 | -0.073 |
| 733 | -0.621 | -0.018 | -0.14 |
| 734 | -0.647 | 0.096 | -0.227 |
| 735 | -0.612 | 0.134 | -0.22 |
| 736 | -0.544 | 0.116 | -0.117 |
| 737 | -0.516 | 0.059 | -0.032 |
| 738 | -0.51 | -0.013 | 0.05 |
| 739 | -0.507 | -0.004 | 0.07 |
| 740 | -0.5 | 0.067 | 0.008 |
| 741 | -0.471 | 0.041 | -0.03 |
| 742 | -0.441 | 0.182 | -0.186 |
| 743 | -0.451 | -0.019 | -0.053 |
| 744 | -0.46 | 0.024 | -0.05 |
| 745 | -0.44 | 0.087 | -0.064 |
| 746 | -0.403 | 0.008 | 0.158 |
| 747 | -0.374 | -0.099 | 0.272 |
| 748 | -0.366 | -0.112 | 0.231 |
| 749 | -0.394 | 0.002 | 0.024 |
| 750 | -0.394 | -0.069 | -0.066 |
| 751 | -0.457 | -0.094 | -0.076 |
| 752 | -0.42 | 0.172 | -0.249 |
| 753 | -0.267 | 0.052 | -0.01 |
| 754 | -0.239 | -0.036 | 0.372 |
| 755 | -0.217 | -0.202 | 0.3 |
| 756 | -0.247 | -0.184 | 0.229 |
| 757 | -0.224 | 0.005 | 0.12 |
| 758 | -0.095 | -0.144 | 0.028 |
| 759 | -0.146 | -0.101 | 0.207 |
| 760 | -0.25 | -0.002 | 0.249 |
| 761 | -0.302 | -0.047 | 0.142 |
| 762 | -0.323 | -0.027 | 0.125 |
| 763 | -0.236 | -0.047 | 0.169 |
| 764 | -0.168 | -0.084 | 0.237 |
| 765 | -0.163 | -0.051 | 0.213 |
| 766 | -0.086 | -0.16 | 0.198 |
| 767 | -0.084 | -0.196 | 0.227 |
| 768 | -0.063 | -0.082 | 0.176 |
| 769 | -0.032 | -0.126 | 0.125 |
| 770 | -0.085 | -0.076 | 0.066 |
| 771 | -0.12 | 0.001 | 0.089 |
| 772 | -0.074 | -0.181 | 0.172 |
| 773 | -0.06 | -0.133 | 0.23 |
| 774 | -0.04 | -0.026 | 0.262 |
| 775 | -0.002 | -0.099 | 0.271 |
| 776 | -0.031 | -0.182 | 0.203 |
| 777 | -0.049 | -0.066 | 0.164 |
| 778 | -0.036 | -0.017 | 0.132 |
| 779 | 0.029 | -0.16 | 0.107 |
| 780 | 0.064 | -0.129 | 0.135 |
| 781 | 0.059 | -0.03 | 0.236 |
| 782 | 0.067 | -0.134 | 0.207 |
| 783 | 0.075 | -0.144 | 0.259 |
| 784 | 0.109 | -0.021 | 0.222 |
| 785 | 0.142 | 0.033 | 0.064 |
| 786 | 0.21 | 0.02 | 0.081 |
| 787 | 0.249 | 0.025 | 0.191 |
| 788 | 0.22 | -0.045 | 0.194 |
| 789 | 0.156 | -0.049 | 0.119 |
| 790 | 0.203 | -0.057 | 0.12 |
| 791 | 0.245 | -0.048 | 0.204 |
| 792 | 0.405 | -0.035 | 0.218 |
| 793 | 0.471 | -0.017 | 0.17 |
| 794 | 0.485 | -0.068 | 0.178 |
| 795 | 0.712 | 0.036 | 0.236 |
| 796 | 1.171 | 0.115 | 0.438 |
| 797 | 1.269 | -0.205 | 0.353 |
| 798 | 1.174 | -0.149 | 0.064 |
| 799 | 1.334 | -0.296 | 0.159 |
| 800 | 1.074 | -0.148 | 0.18 |
| 801 | 0.989 | 0.075 | 0.275 |
| 802 | 0.614 | 0.02 | 0.169 |
| 803 | 0.126 | -0.147 | -0.013 |
| 804 | -0.542 | -0.362 | -0.241 |
| 805 | -1.125 | 0.059 | -0.291 |
| 806 | -0.511 | 0.686 | 0.248 |
| 807 | 0.169 | 0.444 | 0.545 |
| 808 | 0.45 | -0.261 | 0.249 |
| 809 | 0.708 | -0.72 | -0.051 |
| 810 | 0.799 | -0.744 | -0.002 |
| 811 | 0.662 | -0.181 | 0.202 |
| 812 | 0.324 | 0.242 | 0.394 |
| 813 | -0.107 | 0.197 | 0.282 |
| 814 | -0.496 | -0.033 | -0.041 |
| 815 | -0.531 | 0.017 | -0.066 |
| 816 | -0.258 | 0.139 | 0.226 |
| 817 | 0.125 | 0.011 | 0.345 |
| 818 | 0.235 | -0.194 | 0.173 |
| 819 | 0.314 | -0.291 | 0.013 |
| 820 | 0.294 | -0.213 | 0.01 |
| 821 | 0.177 | -0.007 | 0.184 |
| 822 | 0.078 | 0.104 | 0.264 |
| 823 | 0.032 | -0.15 | 0.15 |
| 824 | -0.051 | -0.301 | 0.018 |
| 825 | -0.154 | -0.12 | 0.038 |
| 826 | -0.273 | 0.058 | 0.127 |
| 827 | -0.261 | 0.1 | 0.195 |
| 828 | -0.052 | -0.009 | 0.215 |
| 829 | 0.13 | -0.205 | 0.186 |
| 830 | 0.18 | -0.15 | 0.196 |
| 831 | 0.132 | -0.043 | 0.213 |
| 832 | 0.1 | -0.09 | 0.208 |
| 833 | 0.079 | -0.174 | 0.213 |
| 834 | 0.024 | -0.216 | 0.224 |
| 835 | -0.095 | -0.086 | 0.183 |
| 836 | -0.197 | -0.086 | 0.156 |
| 837 | -0.25 | -0.015 | 0.158 |
| 838 | -0.191 | 0.063 | 0.168 |
| 839 | 0.006 | -0.138 | 0.204 |
| 840 | 0.022 | -0.16 | 0.224 |
| 841 | -0.015 | -0.059 | 0.232 |
| 842 | -0.049 | -0.103 | 0.208 |
| 843 | -0.086 | -0.107 | 0.263 |
| 844 | -0.111 | -0.082 | 0.202 |
| 845 | -0.133 | -0.172 | 0.191 |
| 846 | -0.219 | -0.06 | 0.136 |
| 847 | -0.25 | -0.028 | 0.122 |
| 848 | -0.214 | -0.123 | 0.17 |
| 849 | -0.249 | -0.141 | 0.164 |
| 850 | -0.32 | -0.035 | 0.132 |
| 851 | -0.36 | 0.043 | 0.146 |
| 852 | -0.363 | -0.044 | 0.172 |
| 853 | -0.347 | -0.002 | 0.113 |
| 854 | -0.456 | -0.068 | 0.031 |
| 855 | -0.396 | -0.109 | 0.094 |
| 856 | -0.53 | 0.015 | -0.022 |
| 857 | -0.62 | -0.103 | -0.065 |
| 858 | -0.654 | -0.077 | -0.046 |
| 859 | -0.696 | 0.022 | -0.077 |
| 860 | -0.734 | 0.079 | -0.16 |
| 861 | -0.732 | 0.096 | -0.16 |
| 862 | -0.718 | 0.139 | -0.1 |
| 863 | -0.715 | 0.112 | -0.062 |
| 864 | -0.709 | 0.078 | -0.025 |
| 865 | -0.744 | 0.078 | -0.042 |
| 866 | -0.752 | 0.134 | -0.138 |
| 867 | -0.717 | 0.157 | -0.191 |
| 868 | -0.673 | 0.082 | -0.119 |
| 869 | -0.631 | 0.077 | -0.07 |
| 870 | -0.603 | 0.058 | -0.06 |
| 871 | -0.591 | -0.043 | -0.036 |
| 872 | -0.594 | -0.043 | -0.008 |
| 873 | -0.613 | -0.01 | 0.009 |
| 874 | -0.635 | 0.029 | 0.028 |
| 875 | -0.647 | 0.067 | 0.029 |
| 876 | -0.7 | 0.159 | -0.063 |
| 877 | -0.646 | 0.31 | -0.272 |
| 878 | -0.568 | 0.089 | -0.028 |
| 879 | -0.468 | -0.136 | 0.198 |
| 880 | -0.394 | -0.056 | 0.041 |
| 881 | -0.337 | -0.205 | 0.171 |
| 882 | -0.326 | -0.197 | 0.24 |
| 883 | -0.357 | -0.1 | 0.181 |
| 884 | -0.348 | -0.106 | 0.2 |
| 885 | -0.365 | 0.119 | 0.016 |
| 886 | -0.19 | 0.163 | -0.047 |
| 887 | -0.156 | -0.125 | 0.252 |
| 888 | -0.117 | -0.319 | 0.3 |
| 889 | -0.146 | -0.19 | 0.043 |
| 890 | -0.172 | -0.106 | 0.109 |
| 891 | -0.22 | -0.169 | 0.372 |
| 892 | -0.352 | 0.039 | 0.207 |
| 893 | -0.363 | 0.107 | -0.034 |
| 894 | -0.119 | 0.012 | 0.127 |
| 895 | 0.108 | -0.194 | 0.34 |
| 896 | 0.053 | -0.313 | 0.258 |
| 897 | -0.033 | -0.308 | 0.221 |
| 898 | -0.019 | -0.039 | 0.169 |
| 899 | -0.032 | 0.046 | 0.166 |
| 900 | -0.1 | 0.027 | 0.157 |
| 901 | -0.087 | -0.049 | 0.102 |
| 902 | -0.038 | -0.276 | 0.176 |
| 903 | -0.012 | -0.183 | 0.193 |
| 904 | -0.02 | -0.061 | 0.231 |
| 905 | -0.114 | 0.001 | 0.243 |
| 906 | -0.108 | -0.008 | 0.148 |
| 907 | -0.036 | -0.048 | 0.108 |
| 908 | 0.042 | -0.084 | 0.097 |
| 909 | 0.124 | -0.157 | 0.183 |
| 910 | 0.174 | -0.193 | 0.279 |
| 911 | 0.172 | -0.124 | 0.221 |
| 912 | 0.197 | -0.031 | 0.167 |
| 913 | 0.207 | -0.071 | 0.139 |
| 914 | 0.143 | -0.09 | 0.136 |
| 915 | 0.08 | -0.074 | 0.17 |
| 916 | 0.09 | -0.035 | 0.167 |
| 917 | 0.134 | -0.04 | 0.224 |
| 918 | 0.198 | -0.029 | 0.212 |
| 919 | 0.295 | 0.002 | 0.128 |
| 920 | 0.354 | -0.085 | 0.145 |
| 921 | 0.384 | -0.161 | 0.204 |
| 922 | 0.38 | -0.102 | 0.239 |
| 923 | 0.292 | -0.001 | 0.181 |
| 924 | 0.217 | 0.012 | 0.11 |
| 925 | 0.235 | 0.066 | 0.125 |
| 926 | 0.283 | 0.008 | 0.173 |
| 927 | 0.314 | -0.045 | 0.131 |
| 928 | 0.345 | -0.03 | 0.108 |
| 929 | 0.428 | -0.09 | 0.159 |
| 930 | 0.459 | -0.118 | 0.176 |
| 931 | 0.416 | -0.039 | 0.136 |
| 932 | 0.351 | -0.044 | 0.107 |
| 933 | 0.291 | -0.071 | 0.133 |
| 934 | 0.232 | 0 | 0.143 |
| 935 | 0.226 | 0.007 | 0.13 |
| 936 | 0.24 | -0.069 | 0.1 |
| 937 | 0.261 | -0.112 | 0.144 |
| 938 | 0.27 | -0.054 | 0.193 |
| 939 | 0.268 | -0.102 | 0.218 |
| 940 | 0.249 | -0.158 | 0.204 |
| 941 | 0.221 | -0.032 | 0.203 |
| 942 | 0.17 | -0.108 | 0.211 |
| 943 | 0.128 | -0.045 | 0.191 |
| 944 | 0.107 | -0.031 | 0.207 |
| 945 | 0.094 | -0.071 | 0.212 |
| 946 | 0.075 | -0.058 | 0.166 |
| 947 | 0.066 | -0.135 | 0.195 |
| 948 | 0.039 | -0.037 | 0.2 |
| 949 | 0.023 | -0.089 | 0.167 |
| 950 | -0.003 | -0.1 | 0.129 |
| 951 | -0.001 | -0.105 | 0.147 |
| 952 | 0.007 | -0.118 | 0.186 |
| 953 | 0.021 | -0.14 | 0.18 |
| 954 | -0.017 | -0.123 | 0.137 |
| 955 | -0.015 | -0.122 | 0.154 |
| 956 | 0.003 | -0.133 | 0.222 |
| 957 | -0.026 | -0.133 | 0.225 |
| 958 | -0.044 | -0.08 | 0.233 |
| 959 | -0.034 | -0.095 | 0.244 |
| 960 | -0.045 | -0.128 | 0.207 |
| 961 | -0.055 | -0.116 | 0.178 |
| 962 | -0.029 | -0.098 | 0.238 |
| 963 | -0.042 | -0.176 | 0.226 |
| 964 | -0.087 | -0.146 | 0.172 |
| 965 | -0.102 | -0.183 | 0.236 |
| 966 | -0.141 | -0.08 | 0.245 |
| 967 | -0.134 | -0.054 | 0.23 |
| 968 | -0.153 | -0.074 | 0.218 |
| 969 | -0.189 | -0.086 | 0.196 |
| 970 | -0.201 | -0.152 | 0.197 |
| 971 | -0.244 | -0.107 | 0.14 |
| 972 | -0.32 | -0.112 | 0.114 |
| 973 | -0.277 | -0.076 | 0.159 |
| 974 | -0.427 | 0.076 | 0.086 |
| 975 | -0.387 | -0.204 | 0.085 |
| 976 | -0.432 | -0.051 | 0.004 |
| 977 | -0.416 | -0.072 | -0.001 |
| 978 | -0.372 | -0.133 | 0.042 |
| 979 | -0.488 | -0.06 | -0.003 |
| 980 | -0.521 | -0.133 | 0.01 |
| 981 | -0.579 | -0.098 | 0.009 |
| 982 | -0.662 | -0.018 | -0.052 |
| 983 | -0.713 | 0.072 | -0.078 |
| 984 | -0.754 | -0.056 | -0.103 |
| 985 | -0.805 | 0.087 | -0.143 |
| 986 | -0.8 | 0.11 | -0.144 |
| 987 | -0.762 | 0.15 | -0.187 |
| 988 | -0.725 | 0.204 | -0.192 |
| 989 | -0.717 | 0.066 | -0.151 |
| 990 | -0.734 | -0.032 | -0.093 |
| 991 | -0.708 | -0.023 | -0.05 |
| 992 | -0.644 | 0.003 | -0.024 |
| 993 | -0.592 | 0.015 | 0.023 |
| 994 | -0.55 | 0.02 | -0.009 |
| 995 | -0.564 | 0.065 | -0.043 |
| 996 | -0.601 | 0.032 | 0.029 |
| 997 | -0.631 | -0.025 | 0.077 |
| 998 | -0.624 | -0.027 | 0.063 |
| 999 | -0.582 | -0.02 | 0.024 |
| 1000 | -0.64 | 0.083 | -0.077 |
| 1001 | -0.594 | -0.005 | 0.003 |
| 1002 | -0.606 | 0.016 | 0.093 |
| 1003 | -0.548 | 0.142 | -0.026 |
| 1004 | -0.401 | 0.057 | 0.022 |
| 1005 | -0.308 | -0.241 | 0.271 |
| 1006 | -0.227 | -0.305 | 0.308 |
| 1007 | -0.235 | -0.252 | 0.147 |
| 1008 | -0.312 | -0.129 | 0.056 |
| 1009 | -0.341 | 0.169 | -0.054 |
| 1010 | -0.398 | 0.023 | -0.042 |
| 1011 | -0.327 | -0.108 | 0.086 |
| 1012 | -0.281 | -0.063 | 0.191 |
| 1013 | -0.228 | -0.277 | 0.221 |
| 1014 | -0.206 | -0.178 | 0.221 |
| 1015 | -0.24 | -0.086 | 0.202 |
| 1016 | -0.219 | -0.075 | 0.174 |
| 1017 | -0.203 | -0.037 | 0.313 |
| 1018 | -0.244 | 0.009 | 0.322 |
| 1019 | -0.166 | -0.176 | 0.219 |
| 1020 | -0.094 | -0.172 | 0.128 |
| 1021 | -0.049 | -0.218 | 0.059 |
| 1022 | -0.09 | -0.146 | 0.165 |
| 1023 | -0.104 | -0.075 | 0.32 |
| 1024 | -0.112 | -0.018 | 0.319 |
| 1025 | -0.121 | 0.012 | 0.281 |
| 1026 | -0.054 | -0.063 | 0.201 |
| 1027 | -0.049 | -0.214 | 0.096 |
| 1028 | -0.119 | -0.254 | 0.01 |
| 1029 | -0.153 | -0.075 | 0.139 |
| 1030 | -0.155 | -0.051 | 0.302 |
| 1031 | -0.13 | -0.063 | 0.28 |
| 1032 | -0.02 | -0.04 | 0.185 |
| 1033 | 0.081 | -0.102 | 0.191 |
| 1034 | 0.15 | -0.198 | 0.199 |
| 1035 | 0.227 | -0.224 | 0.163 |
| 1036 | 0.198 | -0.197 | 0.221 |
| 1037 | 0.114 | -0.068 | 0.257 |
| 1038 | 0.075 | 0.033 | 0.218 |
| 1039 | 0.08 | -0.013 | 0.244 |
| 1040 | 0.091 | -0.004 | 0.163 |
| 1041 | 0.177 | -0.088 | 0.147 |
| 1042 | 0.303 | -0.134 | 0.207 |
| 1043 | 0.36 | -0.112 | 0.147 |
| 1044 | 0.393 | -0.145 | 0.186 |
| 1045 | 0.357 | -0.09 | 0.24 |
| 1046 | 0.289 | -0.019 | 0.21 |
| 1047 | 0.253 | -0.085 | 0.176 |
| 1048 | 0.239 | -0.09 | 0.174 |
| 1049 | 0.245 | -0.071 | 0.175 |
| 1050 | 0.246 | -0.036 | 0.159 |
| 1051 | 0.29 | -0.012 | 0.175 |
| 1052 | 0.316 | 0.016 | 0.181 |
| 1053 | 0.337 | -0.045 | 0.208 |
| 1054 | 0.315 | -0.122 | 0.211 |
| 1055 | 0.262 | -0.097 | 0.17 |
| 1056 | 0.258 | -0.031 | 0.154 |
| 1057 | 0.251 | 0.008 | 0.204 |
| 1058 | 0.19 | 0.092 | 0.165 |
| 1059 | 0.18 | 0.013 | 0.142 |
| 1060 | 0.232 | -0.112 | 0.201 |
| 1061 | 0.221 | -0.1 | 0.182 |
| 1062 | 0.21 | -0.163 | 0.136 |
| 1063 | 0.187 | -0.16 | 0.179 |
| 1064 | 0.153 | -0.112 | 0.178 |
| 1065 | 0.136 | -0.084 | 0.159 |
| 1066 | 0.145 | -0.086 | 0.19 |
| 1067 | 0.121 | -0.103 | 0.207 |
| 1068 | 0.071 | -0.038 | 0.221 |
| 1069 | 0.053 | -0.077 | 0.186 |
| 1070 | 0.04 | -0.081 | 0.153 |
| 1071 | 0.022 | -0.063 | 0.19 |
| 1072 | 0.049 | -0.127 | 0.168 |
| 1073 | 0.044 | -0.149 | 0.161 |
| 1074 | 0.036 | -0.101 | 0.249 |
| 1075 | 0.03 | -0.085 | 0.28 |
| 1076 | 0.008 | -0.121 | 0.23 |
| 1077 | -0.013 | -0.117 | 0.216 |
| 1078 | -0.019 | -0.103 | 0.202 |
| 1079 | -0.015 | -0.126 | 0.169 |
| 1080 | -0.026 | -0.167 | 0.186 |
| 1081 | -0.067 | -0.111 | 0.155 |
| 1082 | -0.049 | -0.071 | 0.213 |
| 1083 | -0.082 | -0.088 | 0.225 |
| 1084 | -0.072 | -0.143 | 0.249 |
| 1085 | -0.076 | -0.139 | 0.254 |
| 1086 | -0.069 | -0.196 | 0.247 |
| 1087 | -0.093 | -0.131 | 0.198 |
| 1088 | -0.09 | -0.146 | 0.195 |
| 1089 | -0.072 | -0.166 | 0.196 |
| 1090 | -0.092 | -0.08 | 0.216 |
| 1091 | -0.089 | -0.235 | 0.202 |
| 1092 | -0.132 | -0.132 | 0.197 |
| 1093 | -0.133 | -0.134 | 0.268 |
| 1094 | -0.154 | -0.117 | 0.283 |
| 1095 | -0.162 | -0.158 | 0.261 |
| 1096 | -0.201 | -0.179 | 0.233 |
| 1097 | -0.22 | -0.174 | 0.213 |
| 1098 | -0.256 | -0.142 | 0.178 |
| 1099 | -0.299 | -0.106 | 0.21 |
| 1100 | -0.355 | -0.069 | 0.221 |
| 1101 | -0.425 | 0.046 | 0.174 |
| 1102 | -0.464 | 0.002 | 0.147 |
| 1103 | -0.488 | -0.001 | 0.165 |
| 1104 | -0.523 | -0.001 | 0.097 |
| 1105 | -0.603 | -0.102 | 0.06 |
| 1106 | -0.568 | -0.052 | 0.048 |
| 1107 | -0.662 | -0.04 | -0.018 |
| 1108 | -0.691 | -0.081 | 0.001 |
| 1109 | -0.704 | 0.01 | -0.039 |
| 1110 | -0.71 | 0.043 | -0.088 |
| 1111 | -0.728 | 0.004 | -0.066 |
| 1112 | -0.736 | 0.035 | -0.095 |
| 1113 | -0.745 | 0.049 | -0.091 |
| 1114 | -0.744 | -0.01 | -0.022 |
| 1115 | -0.782 | 0.051 | -0.038 |
| 1116 | -0.796 | 0.094 | -0.071 |
| 1117 | -0.777 | 0.093 | -0.094 |
| 1118 | -0.724 | 0.172 | -0.135 |
| 1119 | -0.666 | 0.02 | -0.057 |
| 1120 | -0.644 | -0.062 | 0.005 |
| 1121 | -0.679 | 0.016 | -0.002 |
| 1122 | -0.683 | 0.027 | 0.026 |
| 1123 | -0.689 | 0.037 | 0 |
| 1124 | -0.697 | 0.038 | -0.026 |
| 1125 | -0.627 | 0.025 | -0.083 |
| 1126 | -0.52 | 0.03 | -0.063 |
| 1127 | -0.477 | -0.163 | 0.141 |
| 1128 | -0.514 | -0.178 | 0.194 |
| 1129 | -0.547 | -0.038 | 0.161 |
| 1130 | -0.481 | 0.067 | 0.141 |
| 1131 | -0.369 | 0.154 | 0.142 |
| 1132 | -0.281 | -0.102 | 0.298 |
| 1133 | -0.296 | -0.402 | 0.253 |
| 1134 | -0.367 | -0.281 | 0.056 |
| 1135 | -0.359 | -0.137 | 0.123 |
| 1136 | -0.342 | 0.012 | 0.073 |
| 1137 | -0.34 | 0.185 | 0.089 |
| 1138 | -0.277 | 0.079 | 0.36 |
| 1139 | -0.135 | -0.223 | 0.31 |
| 1140 | -0.028 | -0.343 | 0.184 |
| 1141 | 0.008 | -0.374 | 0.207 |
| 1142 | -0.091 | -0.253 | 0.241 |
| 1143 | -0.218 | -0.038 | 0.257 |
| 1144 | -0.232 | 0.093 | 0.261 |
| 1145 | -0.217 | 0.017 | 0.265 |
| 1146 | -0.162 | -0.089 | 0.208 |
| 1147 | -0.035 | -0.241 | 0.175 |
| 1148 | 0.044 | -0.374 | 0.236 |
| 1149 | 0.073 | -0.199 | 0.253 |
| 1150 | 0.021 | 0.022 | 0.186 |
| 1151 | -0.05 | -0.067 | 0.179 |
| 1152 | -0.148 | -0.069 | 0.225 |
| 1153 | -0.202 | -0.059 | 0.183 |
| 1154 | -0.19 | -0.211 | 0.171 |
| 1155 | -0.161 | -0.167 | 0.161 |
| 1156 | -0.053 | -0.093 | 0.157 |
| 1157 | 0.034 | -0.075 | 0.288 |
| 1158 | 0.084 | -0.061 | 0.246 |
| 1159 | 0.086 | -0.172 | 0.162 |
| 1160 | 0.103 | -0.246 | 0.125 |
| 1161 | 0.084 | -0.191 | 0.172 |
| 1162 | -0.011 | -0.118 | 0.223 |
| 1163 | -0.081 | -0.107 | 0.169 |
| 1164 | -0.099 | -0.08 | 0.19 |
| 1165 | -0.018 | -0.109 | 0.203 |
| 1166 | 0.092 | -0.168 | 0.198 |
| 1167 | 0.194 | -0.095 | 0.215 |
| 1168 | 0.193 | -0.109 | 0.237 |
| 1169 | 0.166 | -0.049 | 0.253 |
| 1170 | 0.125 | -0.004 | 0.215 |
| 1171 | 0.118 | -0.061 | 0.217 |
| 1172 | 0.099 | -0.099 | 0.162 |
| 1173 | 0.104 | -0.081 | 0.103 |
| 1174 | 0.165 | -0.025 | 0.161 |
| 1175 | 0.238 | -0.035 | 0.188 |
| 1176 | 0.316 | -0.08 | 0.202 |
| 1177 | 0.389 | -0.081 | 0.233 |
| 1178 | 0.402 | -0.068 | 0.236 |
| 1179 | 0.404 | -0.118 | 0.233 |
| 1180 | 0.364 | -0.157 | 0.245 |
| 1181 | 0.281 | -0.088 | 0.213 |
| 1182 | 0.249 | 0.002 | 0.206 |
| 1183 | 0.241 | -0.003 | 0.189 |
| 1184 | 0.226 | -0.042 | 0.215 |
| 1185 | 0.234 | -0.072 | 0.198 |
| 1186 | 0.228 | -0.126 | 0.237 |
| 1187 | 0.189 | -0.155 | 0.262 |
| 1188 | 0.105 | -0.021 | 0.162 |
| 1189 | 0.083 | -0.075 | 0.186 |
| 1190 | 0.077 | -0.069 | 0.234 |
| 1191 | 0.093 | -0.098 | 0.184 |
| 1192 | 0.1 | -0.211 | 0.189 |
| 1193 | 0.064 | -0.164 | 0.202 |
| 1194 | 0.032 | -0.111 | 0.189 |
| 1195 | 0.024 | -0.125 | 0.201 |
| 1196 | 0.003 | -0.079 | 0.212 |
| 1197 | -0.015 | -0.099 | 0.208 |
| 1198 | -0.02 | -0.151 | 0.169 |
| 1199 | -0.006 | -0.155 | 0.186 |
| 1200 | -0.001 | -0.142 | 0.221 |
| 1201 | -0.031 | -0.138 | 0.233 |
| 1202 | -0.071 | -0.105 | 0.223 |
| 1203 | -0.058 | -0.086 | 0.255 |
| 1204 | -0.06 | -0.174 | 0.274 |
| 1205 | -0.082 | -0.153 | 0.237 |
| 1206 | -0.078 | -0.158 | 0.233 |
| 1207 | -0.084 | -0.153 | 0.227 |
| 1208 | -0.106 | -0.173 | 0.214 |
| 1209 | -0.127 | -0.105 | 0.243 |
| 1210 | -0.124 | -0.167 | 0.253 |
| 1211 | -0.148 | -0.168 | 0.197 |
| 1212 | -0.164 | -0.151 | 0.229 |
| 1213 | -0.182 | -0.195 | 0.215 |
| 1214 | -0.215 | -0.114 | 0.218 |
| 1215 | -0.195 | -0.075 | 0.269 |
| 1216 | -0.191 | -0.187 | 0.274 |
| 1217 | -0.226 | -0.116 | 0.233 |
| 1218 | -0.224 | -0.113 | 0.23 |
| 1219 | -0.254 | -0.1 | 0.26 |
| 1220 | -0.327 | -0.103 | 0.237 |
| 1221 | -0.365 | -0.109 | 0.166 |
| 1222 | -0.374 | -0.134 | 0.192 |
| 1223 | -0.389 | -0.093 | 0.146 |
| 1224 | -0.422 | -0.114 | 0.134 |
| 1225 | -0.447 | -0.084 | 0.181 |
| 1226 | -0.487 | -0.018 | 0.14 |
| 1227 | -0.532 | -0.04 | 0.09 |
| 1228 | -0.596 | -0.05 | 0.07 |
| 1229 | -0.658 | -0.052 | 0.08 |
| 1230 | -0.71 | -0.036 | 0.009 |
| 1231 | -0.725 | 0.038 | -0.094 |
| 1232 | -0.724 | 0.088 | -0.033 |
| 1233 | -0.742 | 0.07 | -0.004 |
| 1234 | -0.76 | 0.052 | -0.07 |
| 1235 | -0.744 | -0.015 | -0.04 |
| 1236 | -0.748 | -0.075 | -0.04 |
| 1237 | -0.747 | -0.03 | -0.078 |
| 1238 | -0.726 | 0.008 | -0.038 |
| 1239 | -0.74 | 0.04 | 0.006 |
| 1240 | -0.758 | 0.094 | -0.02 |
| 1241 | -0.708 | 0.153 | -0.051 |
| 1242 | -0.678 | 0.071 | -0.047 |
| 1243 | -0.644 | 0.014 | 0.009 |
| 1244 | -0.597 | -0.037 | 0.084 |
| 1245 | -0.619 | -0.048 | 0.073 |
| 1246 | -0.635 | 0.059 | 0.025 |
| 1247 | -0.671 | -0.036 | 0.053 |
| 1248 | -0.659 | -0.048 | 0.009 |
| 1249 | -0.583 | 0.059 | -0.002 |
| 1250 | -0.46 | -0.047 | 0.077 |
| 1251 | -0.341 | -0.101 | 0.128 |
| 1252 | -0.364 | -0.217 | 0.199 |
| 1253 | -0.401 | -0.21 | 0.228 |
| 1254 | -0.395 | -0.06 | 0.291 |
| 1255 | -0.368 | 0.001 | 0.286 |
| 1256 | -0.378 | -0.047 | 0.161 |
| 1257 | -0.343 | -0.096 | -0.018 |
| 1258 | -0.291 | -0.214 | 0.024 |
| 1259 | -0.362 | -0.311 | 0.286 |
| 1260 | -0.314 | -0.159 | 0.341 |
| 1261 | -0.264 | 0.041 | 0.291 |
| 1262 | -0.207 | 0.009 | 0.278 |
| 1263 | -0.171 | -0.2 | 0.19 |
| 1264 | -0.165 | -0.297 | 0.204 |
| 1265 | -0.115 | -0.215 | 0.257 |
| 1266 | -0.08 | -0.151 | 0.285 |
| 1267 | -0.216 | -0.136 | 0.275 |
| 1268 | -0.298 | -0.026 | 0.164 |
| 1269 | -0.282 | -0.013 | 0.129 |
| 1270 | -0.23 | -0.068 | 0.231 |
| 1271 | -0.081 | -0.118 | 0.204 |
| 1272 | 0.007 | -0.272 | 0.189 |
| 1273 | 0.007 | -0.298 | 0.273 |
| 1274 | 0.024 | -0.209 | 0.402 |
| 1275 | -0.008 | -0.054 | 0.396 |
| 1276 | -0.084 | -0.007 | 0.346 |
| 1277 | -0.198 | -0.076 | 0.263 |
| 1278 | -0.269 | -0.218 | 0.097 |
| 1279 | -0.205 | -0.259 | 0.006 |
| 1280 | -0.148 | -0.174 | 0.081 |
| 1281 | -0.129 | -0.127 | 0.266 |
| 1282 | -0.079 | -0.104 | 0.263 |
| 1283 | -0.022 | -0.094 | 0.174 |
| 1284 | 0.066 | -0.119 | 0.166 |
| 1285 | 0.113 | -0.187 | 0.2 |
| 1286 | 0.105 | -0.207 | 0.211 |
| 1287 | 0.007 | -0.104 | 0.151 |
| 1288 | -0.036 | -0.083 | 0.163 |
| 1289 | 0.032 | -0.09 | 0.256 |
| 1290 | 0.098 | -0.015 | 0.296 |
| 1291 | 0.132 | -0.024 | 0.28 |
| 1292 | 0.213 | -0.139 | 0.284 |
| 1293 | 0.314 | -0.2 | 0.242 |
| 1294 | 0.373 | -0.198 | 0.266 |
| 1295 | 0.341 | -0.144 | 0.267 |
| 1296 | 0.242 | -0.12 | 0.249 |
| 1297 | 0.164 | -0.034 | 0.246 |
| 1298 | 0.124 | 0.012 | 0.209 |
| 1299 | 0.142 | -0.008 | 0.146 |
| 1300 | 0.251 | -0.007 | 0.216 |
| 1301 | 0.286 | -0.104 | 0.216 |
| 1302 | 0.298 | -0.182 | 0.191 |
| 1303 | 0.315 | -0.132 | 0.225 |
| 1304 | 0.291 | -0.101 | 0.272 |
| 1305 | 0.21 | -0.051 | 0.229 |
| 1306 | 0.171 | -0.061 | 0.192 |
| 1307 | 0.153 | -0.073 | 0.209 |
| 1308 | 0.139 | -0.087 | 0.207 |
| 1309 | 0.146 | -0.104 | 0.198 |
| 1310 | 0.148 | -0.157 | 0.206 |
| 1311 | 0.134 | -0.118 | 0.201 |
| 1312 | 0.14 | -0.137 | 0.257 |
| 1313 | 0.103 | -0.095 | 0.246 |
| 1314 | 0.066 | -0.111 | 0.246 |
| 1315 | 0.041 | -0.147 | 0.236 |
| 1316 | 0.018 | -0.173 | 0.232 |
| 1317 | 0.001 | -0.143 | 0.241 |
| 1318 | -0.008 | -0.134 | 0.249 |
| 1319 | -0.013 | -0.167 | 0.261 |
| 1320 | -0.034 | -0.158 | 0.202 |
| 1321 | -0.034 | -0.178 | 0.214 |
| 1322 | -0.036 | -0.192 | 0.238 |
| 1323 | -0.041 | -0.091 | 0.281 |
| 1324 | -0.058 | -0.119 | 0.318 |
| 1325 | -0.125 | -0.12 | 0.274 |
| 1326 | -0.113 | -0.065 | 0.297 |
| 1327 | -0.124 | -0.147 | 0.274 |
| 1328 | -0.151 | -0.137 | 0.232 |
| 1329 | -0.104 | -0.184 | 0.239 |
| 1330 | -0.088 | -0.189 | 0.279 |
| 1331 | -0.106 | -0.164 | 0.285 |
| 1332 | -0.119 | -0.12 | 0.302 |
| 1333 | -0.131 | -0.156 | 0.304 |
| 1334 | -0.171 | -0.121 | 0.249 |
| 1335 | -0.155 | -0.202 | 0.253 |
| 1336 | -0.216 | -0.169 | 0.246 |
| 1337 | -0.227 | -0.133 | 0.298 |
| 1338 | -0.237 | -0.146 | 0.255 |
| 1339 | -0.259 | -0.125 | 0.202 |
| 1340 | -0.266 | -0.266 | 0.139 |
| 1341 | -0.275 | -0.222 | 0.125 |
| 1342 | -0.303 | -0.275 | 0.096 |
| 1343 | -0.397 | -0.168 | 0.147 |
| 1344 | -0.416 | -0.065 | 0.252 |
| 1345 | -0.535 | 0.017 | 0.187 |
| 1346 | -0.375 | -0.122 | 0.308 |
| 1347 | -0.471 | 0.044 | 0.205 |
| 1348 | -0.452 | -0.095 | 0.278 |
| 1349 | -0.524 | -0.121 | 0.218 |
| 1350 | -0.609 | -0.101 | 0.119 |
| 1351 | -0.589 | -0.077 | 0.149 |
| 1352 | -0.65 | -0.061 | 0.116 |
| 1353 | -0.702 | -0.105 | 0.059 |
| 1354 | -0.716 | -0.039 | 0.008 |
| 1355 | -0.73 | -0.073 | -0.011 |
| 1356 | -0.749 | -0.032 | -0.033 |
| 1357 | -0.776 | 0.045 | -0.053 |
| 1358 | -0.797 | -0.01 | -0.015 |
| 1359 | -0.806 | 0.001 | -0.012 |
| 1360 | -0.817 | 0.047 | -0.033 |
| 1361 | -0.819 | 0.049 | -0.047 |
| 1362 | -0.792 | 0.043 | -0.093 |
| 1363 | -0.726 | 0.012 | -0.067 |
| 1364 | -0.722 | -0.074 | -0.005 |
| 1365 | -0.713 | -0.03 | 0.003 |
| 1366 | -0.673 | 0.043 | 0.002 |
| 1367 | -0.655 | -0.028 | 0.111 |
| 1368 | -0.698 | -0.056 | 0.185 |
| 1369 | -0.711 | -0.066 | 0.154 |
| 1370 | -0.718 | 0.073 | -0.091 |
| 1371 | -0.636 | 0.016 | -0.011 |
| 1372 | -0.598 | -0.152 | 0.213 |
| 1373 | -0.529 | -0.04 | 0.183 |
| 1374 | -0.472 | -0.125 | 0.242 |
| 1375 | -0.461 | -0.105 | 0.33 |
| 1376 | -0.444 | -0.014 | 0.163 |
| 1377 | -0.471 | -0.106 | 0.121 |
| 1378 | -0.458 | -0.211 | 0.166 |
| 1379 | -0.433 | -0.109 | 0.046 |
| 1380 | -0.394 | -0.025 | 0.121 |
| 1381 | -0.336 | -0.212 | 0.264 |
| 1382 | -0.297 | -0.328 | 0.364 |
| 1383 | -0.348 | -0.161 | 0.398 |
| 1384 | -0.303 | -0.068 | 0.168 |
| 1385 | -0.262 | -0.108 | 0.069 |
| 1386 | -0.282 | -0.229 | 0.232 |
| 1387 | -0.297 | -0.248 | 0.258 |
| 1388 | -0.228 | -0.158 | 0.211 |
| 1389 | -0.075 | -0.085 | 0.354 |
| 1390 | -0.064 | -0.254 | 0.473 |
| 1391 | -0.115 | -0.209 | 0.441 |
| 1392 | -0.125 | -0.176 | 0.333 |
| 1393 | -0.152 | -0.079 | 0.278 |
| 1394 | -0.172 | 0.128 | 0.29 |
| 1395 | -0.128 | -0.041 | 0.284 |
| 1396 | -0.128 | -0.254 | 0.151 |
| 1397 | -0.07 | -0.25 | 0.139 |
| 1398 | -0.022 | -0.275 | 0.226 |
| 1399 | -0.057 | -0.166 | 0.3 |
| 1400 | -0.074 | -0.111 | 0.331 |
| 1401 | -0.084 | -0.036 | 0.317 |
| 1402 | -0.071 | -0.061 | 0.223 |
| 1403 | -0.016 | -0.084 | 0.215 |
| 1404 | 0.036 | -0.127 | 0.302 |
| 1405 | -0.01 | -0.193 | 0.224 |
| 1406 | -0.038 | -0.154 | 0.272 |
| 1407 | -0.1 | -0.1 | 0.315 |
| 1408 | -0.14 | -0.053 | 0.219 |
| 1409 | -0.059 | -0.122 | 0.22 |
| 1410 | 0.024 | -0.125 | 0.263 |
| 1411 | 0.092 | -0.142 | 0.239 |
| 1412 | 0.161 | -0.233 | 0.282 |
| 1413 | 0.118 | -0.091 | 0.312 |
| 1414 | 0.08 | -0.032 | 0.235 |
| 1415 | 0.069 | -0.071 | 0.182 |
| 1416 | 0.078 | -0.111 | 0.19 |
| 1417 | 0.103 | -0.113 | 0.202 |
| 1418 | 0.145 | -0.144 | 0.191 |
| 1419 | 0.188 | -0.118 | 0.219 |
| 1420 | 0.256 | -0.063 | 0.262 |
| 1421 | 0.294 | -0.041 | 0.26 |
| 1422 | 0.307 | -0.118 | 0.242 |
| 1423 | 0.314 | -0.15 | 0.245 |
| 1424 | 0.299 | -0.111 | 0.231 |
| 1425 | 0.246 | -0.076 | 0.222 |
| 1426 | 0.233 | -0.031 | 0.266 |
| 1427 | 0.206 | -0.07 | 0.268 |
| 1428 | 0.174 | -0.073 | 0.222 |
| 1429 | 0.181 | -0.106 | 0.249 |
| 1430 | 0.186 | -0.169 | 0.219 |
| 1431 | 0.168 | -0.149 | 0.205 |
| 1432 | 0.14 | -0.144 | 0.248 |
| 1433 | 0.113 | -0.139 | 0.26 |
| 1434 | 0.1 | -0.101 | 0.271 |
| 1435 | 0.094 | -0.098 | 0.332 |
| 1436 | 0.052 | -0.128 | 0.322 |
| 1437 | 0.017 | -0.125 | 0.292 |
| 1438 | -0.011 | -0.118 | 0.257 |
| 1439 | -0.038 | -0.122 | 0.248 |
| 1440 | -0.048 | -0.106 | 0.266 |
| 1441 | -0.034 | -0.13 | 0.284 |
| 1442 | -0.036 | -0.161 | 0.252 |
| 1443 | -0.048 | -0.22 | 0.224 |
| 1444 | -0.057 | -0.198 | 0.248 |
| 1445 | -0.067 | -0.144 | 0.285 |
| 1446 | -0.071 | -0.108 | 0.277 |
| 1447 | -0.09 | -0.155 | 0.262 |
| 1448 | -0.104 | -0.139 | 0.244 |
| 1449 | -0.082 | -0.167 | 0.283 |
| 1450 | -0.114 | -0.178 | 0.294 |
| 1451 | -0.126 | -0.096 | 0.321 |
| 1452 | -0.111 | -0.121 | 0.372 |
| 1453 | -0.139 | -0.125 | 0.353 |
| 1454 | -0.169 | -0.129 | 0.281 |
| 1455 | -0.137 | -0.189 | 0.3 |
| 1456 | -0.155 | -0.185 | 0.311 |
| 1457 | -0.265 | -0.073 | 0.199 |
| 1458 | -0.222 | -0.3 | 0.266 |
| 1459 | -0.269 | -0.079 | 0.238 |
| 1460 | -0.225 | -0.22 | 0.353 |
| 1461 | -0.231 | -0.164 | 0.307 |
| 1462 | -0.262 | -0.225 | 0.239 |
| 1463 | -0.289 | -0.097 | 0.272 |
| 1464 | -0.336 | -0.271 | 0.352 |
| 1465 | -0.411 | -0.014 | 0.286 |
| 1466 | -0.454 | -0.029 | 0.27 |
| 1467 | -0.501 | -0.14 | 0.215 |
| 1468 | -0.517 | 0.078 | 0.173 |
| 1469 | -0.523 | -0.145 | 0.185 |
| 1470 | -0.551 | -0.18 | 0.275 |
| 1471 | -0.593 | 0.001 | 0.199 |
| 1472 | -0.669 | -0.077 | 0.002 |
| 1473 | -0.726 | -0.009 | -0.038 |
| 1474 | -0.732 | -0.037 | 0.017 |
| 1475 | -0.789 | -0.07 | -0.008 |
| 1476 | -0.848 | -0.005 | -0.046 |
| 1477 | -0.857 | 0.043 | -0.037 |
| 1478 | -0.876 | 0.052 | -0.071 |
| 1479 | -0.858 | 0.127 | -0.092 |
| 1480 | -0.852 | 0.182 | -0.141 |
| 1481 | -0.855 | 0.073 | -0.084 |
| 1482 | -0.831 | -0.008 | 0.031 |
| 1483 | -0.81 | 0.015 | 0.052 |
| 1484 | -0.753 | 0.092 | 0.053 |
| 1485 | -0.728 | 0.071 | 0.089 |
| 1486 | -0.739 | 0.022 | 0.094 |
| 1487 | -0.746 | 0 | 0.101 |
| 1488 | -0.747 | 0.033 | 0.082 |
| 1489 | -0.707 | 0.075 | 0.034 |
| 1490 | -0.624 | 0.002 | 0.008 |
| 1491 | -0.554 | -0.17 | 0.081 |
| 1492 | -0.565 | -0.207 | 0.22 |
| 1493 | -0.626 | -0.028 | 0.177 |
| 1494 | -0.616 | 0.071 | 0.141 |
| 1495 | -0.512 | -0.022 | 0.251 |
| 1496 | -0.432 | -0.159 | 0.208 |
| 1497 | -0.384 | -0.238 | 0.176 |
| 1498 | -0.384 | -0.178 | 0.255 |
| 1499 | -0.381 | -0.192 | 0.212 |
| 1500 | -0.347 | -0.091 | 0.233 |
| 1501 | -0.301 | -0.121 | 0.341 |
| 1502 | -0.326 | -0.098 | 0.285 |
| 1503 | -0.302 | -0.085 | 0.225 |
| 1504 | -0.227 | -0.18 | 0.346 |
| 1505 | -0.239 | -0.25 | 0.387 |
| 1506 | -0.31 | -0.217 | 0.329 |
| 1507 | -0.339 | -0.054 | 0.233 |
| 1508 | -0.299 | -0.042 | 0.236 |
| 1509 | -0.292 | -0.1 | 0.265 |
| 1510 | -0.278 | -0.236 | 0.205 |
| 1511 | -0.199 | -0.321 | 0.16 |
| 1512 | -0.17 | -0.198 | 0.2 |
| 1513 | -0.141 | -0.214 | 0.206 |
| 1514 | -0.177 | -0.246 | 0.28 |
| 1515 | -0.228 | -0.102 | 0.362 |
| 1516 | -0.236 | -0.084 | 0.274 |
| 1517 | -0.226 | -0.158 | 0.237 |
| 1518 | -0.191 | -0.195 | 0.214 |
| 1519 | -0.147 | -0.262 | 0.2 |
| 1520 | -0.129 | -0.252 | 0.319 |
| 1521 | -0.195 | -0.118 | 0.276 |
| 1522 | -0.146 | -0.061 | 0.304 |
| 1523 | -0.108 | -0.084 | 0.326 |
| 1524 | -0.053 | -0.11 | 0.311 |
| 1525 | -0.008 | -0.171 | 0.335 |
| 1526 | 0.062 | -0.171 | 0.341 |
| 1527 | 0.033 | -0.169 | 0.311 |
| 1528 | -0.027 | -0.138 | 0.266 |
| 1529 | -0.08 | -0.199 | 0.262 |
| 1530 | -0.156 | -0.174 | 0.254 |
| 1531 | -0.121 | -0.187 | 0.21 |
| 1532 | -0.091 | -0.137 | 0.268 |
| 1533 | -0.063 | -0.021 | 0.252 |
| 1534 | 0.003 | -0.063 | 0.224 |
| 1535 | 0.061 | -0.228 | 0.249 |
| 1536 | 0.04 | -0.2 | 0.234 |
| 1537 | 0 | -0.139 | 0.177 |
| 1538 | -0.02 | -0.209 | 0.166 |
| 1539 | -0.05 | -0.135 | 0.258 |
| 1540 | -0.073 | 0.012 | 0.274 |
| 1541 | -0.037 | 0.02 | 0.246 |
| 1542 | -0.133 | -0.025 | 0.167 |
| 1543 | 0.175 | -0.176 | 0.263 |
| 1544 | 0.119 | -0.194 | 0.152 |
| 1545 | 0.143 | -0.275 | 0.152 |
| 1546 | 0.118 | -0.209 | 0.187 |
| 1547 | 0.059 | -0.127 | 0.193 |
| 1548 | 0.066 | -0.094 | 0.203 |
| 1549 | 0.077 | -0.026 | 0.234 |
| 1550 | 0.097 | -0.087 | 0.24 |
| 1551 | 0.118 | -0.127 | 0.207 |
| 1552 | 0.147 | -0.15 | 0.217 |
| 1553 | 0.164 | -0.037 | 0.224 |
| 1554 | 0.199 | 0.04 | 0.312 |
| 1555 | 0.207 | -0.115 | 0.305 |
| 1556 | 0.159 | -0.136 | 0.277 |
| 1557 | 0.138 | -0.101 | 0.319 |
| 1558 | 0.128 | -0.155 | 0.274 |
| 1559 | 0.092 | -0.161 | 0.25 |
| 1560 | 0.086 | -0.1 | 0.26 |
| 1561 | 0.116 | -0.134 | 0.209 |
| 1562 | 0.136 | -0.133 | 0.244 |
| 1563 | 0.128 | -0.209 | 0.288 |
| 1564 | 0.038 | -0.158 | 0.229 |
| 1565 | -0.013 | -0.181 | 0.238 |
| 1566 | -0.038 | -0.105 | 0.252 |
| 1567 | -0.054 | -0.141 | 0.249 |
| 1568 | -0.068 | -0.096 | 0.256 |
| 1569 | -0.023 | -0.229 | 0.272 |
| 1570 | 0.008 | -0.224 | 0.284 |
| 1571 | 0.017 | -0.232 | 0.31 |
| 1572 | -0.022 | -0.188 | 0.334 |
| 1573 | -0.081 | -0.185 | 0.328 |
| 1574 | -0.097 | -0.11 | 0.349 |
| 1575 | -0.102 | -0.177 | 0.314 |
| 1576 | -0.118 | -0.207 | 0.266 |
| 1577 | -0.129 | -0.201 | 0.268 |
| 1578 | -0.105 | -0.19 | 0.315 |
| 1579 | -0.115 | -0.24 | 0.331 |
| 1580 | -0.147 | -0.175 | 0.312 |
| 1581 | -0.157 | -0.156 | 0.358 |
| 1582 | -0.19 | -0.26 | 0.276 |
| 1583 | -0.173 | -0.223 | 0.245 |
| 1584 | -0.144 | -0.247 | 0.29 |
| 1585 | -0.16 | -0.252 | 0.267 |
| 1586 | -0.159 | -0.199 | 0.318 |
| 1587 | -0.183 | -0.172 | 0.379 |
| 1588 | -0.166 | -0.246 | 0.344 |
| 1589 | -0.221 | -0.15 | 0.324 |
| 1590 | -0.23 | -0.269 | 0.327 |
| 1591 | -0.246 | -0.141 | 0.315 |
| 1592 | -0.239 | -0.236 | 0.34 |
| 1593 | -0.284 | -0.201 | 0.339 |
| 1594 | -0.303 | -0.207 | 0.365 |
| 1595 | -0.348 | -0.237 | 0.397 |
| 1596 | -0.471 | -0.092 | 0.3 |
| 1597 | -0.531 | -0.218 | 0.262 |
| 1598 | -0.562 | -0.125 | 0.281 |
| 1599 | -0.596 | -0.078 | 0.227 |
| 1600 | -0.645 | -0.141 | 0.196 |
| 1601 | -0.689 | -0.099 | 0.17 |
| 1602 | -0.749 | -0.095 | 0.13 |
| 1603 | -0.827 | -0.054 | 0.11 |
| 1604 | -0.87 | -0.014 | 0.038 |
| 1605 | -0.913 | -0.03 | -0.042 |
| 1606 | -0.924 | -0.003 | -0.053 |
| 1607 | -0.913 | 0.056 | -0.035 |
| 1608 | -0.937 | 0.009 | -0.014 |
| 1609 | -0.947 | -0.03 | -0.049 |
| 1610 | -0.933 | 0.009 | -0.05 |
| 1611 | -0.901 | 0.042 | -0.001 |
| 1612 | -0.908 | 0.03 | 0.015 |
| 1613 | -0.91 | 0.059 | 0.012 |
| 1614 | -0.87 | 0.081 | -0.01 |
| 1615 | -0.806 | 0.022 | 0.027 |
| 1616 | -0.771 | -0.025 | 0.084 |
| 1617 | -0.788 | 0.049 | 0.159 |
| 1618 | -0.817 | 0.03 | 0.197 |
| 1619 | -0.844 | -0.006 | 0.146 |
| 1620 | -0.797 | 0.066 | 0.035 |
| 1621 | -0.746 | 0.044 | 0.009 |
| 1622 | -0.728 | -0.138 | 0.155 |
| 1623 | -0.676 | -0.136 | 0.175 |
| 1624 | -0.66 | -0.132 | 0.209 |
| 1625 | -0.69 | -0.156 | 0.339 |
| 1626 | -0.635 | -0.22 | 0.295 |
| 1627 | -0.592 | -0.163 | 0.249 |
| 1628 | -0.647 | 0.075 | 0.182 |
| 1629 | -0.441 | 0.008 | 0.121 |
| 1630 | -0.245 | -0.227 | 0.199 |
| 1631 | -0.285 | -0.41 | 0.316 |
| 1632 | -0.279 | -0.453 | 0.356 |
| 1633 | -0.345 | -0.14 | 0.473 |
| 1634 | -0.325 | 0.127 | 0.416 |
| 1635 | -0.257 | -0.103 | 0.313 |
| 1636 | -0.312 | -0.339 | 0.347 |
| 1637 | -0.298 | -0.338 | 0.256 |
| 1638 | -0.27 | -0.361 | 0.277 |
| 1639 | -0.252 | -0.217 | 0.372 |
| 1640 | -0.274 | -0.129 | 0.452 |
| 1641 | -0.238 | -0.058 | 0.442 |
| 1642 | -0.123 | -0.093 | 0.365 |
| 1643 | -0.11 | -0.25 | 0.275 |
| 1644 | -0.078 | -0.326 | 0.219 |
| 1645 | -0.066 | -0.365 | 0.277 |
| 1646 | -0.083 | -0.343 | 0.268 |
| 1647 | -0.141 | -0.123 | 0.206 |
| 1648 | -0.141 | -0.113 | 0.275 |
| 1649 | -0.148 | -0.094 | 0.384 |
| 1650 | -0.159 | -0.179 | 0.358 |
| 1651 | -0.096 | -0.189 | 0.29 |
| 1652 | -0.05 | -0.225 | 0.307 |
| 1653 | 0.044 | -0.251 | 0.311 |
| 1654 | 0.133 | -0.229 | 0.327 |
| 1655 | 0.165 | -0.172 | 0.367 |
| 1656 | 0.176 | -0.176 | 0.355 |
| 1657 | 0.164 | -0.157 | 0.372 |
| 1658 | 0.105 | -0.215 | 0.3 |
| 1659 | 0.033 | -0.212 | 0.274 |
| 1660 | -0.002 | -0.141 | 0.263 |
| 1661 | 0.045 | -0.097 | 0.269 |
| 1662 | 0.108 | -0.107 | 0.33 |
| 1663 | 0.139 | -0.016 | 0.326 |
| 1664 | 0.205 | -0.1 | 0.294 |
| 1665 | 0.258 | -0.277 | 0.268 |
| 1666 | 0.244 | -0.182 | 0.257 |
| 1667 | 0.192 | -0.147 | 0.267 |
| 1668 | 0.138 | -0.098 | 0.252 |
| 1669 | 0.134 | -0.063 | 0.253 |
| 1670 | 0.167 | -0.05 | 0.302 |
| 1671 | 0.199 | -0.031 | 0.286 |
| 1672 | 0.224 | -0.127 | 0.26 |
| 1673 | 0.207 | -0.111 | 0.243 |
| 1674 | 0.199 | -0.148 | 0.219 |
| 1675 | 0.169 | -0.209 | 0.228 |
| 1676 | 0.126 | -0.197 | 0.266 |
| 1677 | 0.11 | -0.16 | 0.354 |
| 1678 | 0.08 | -0.144 | 0.347 |
| 1679 | 0.076 | -0.14 | 0.246 |
| 1680 | 0.089 | -0.139 | 0.325 |
| 1681 | 0.089 | -0.155 | 0.318 |
| 1682 | 0.061 | -0.183 | 0.269 |
| 1683 | 0.019 | -0.223 | 0.277 |
| 1684 | -0.022 | -0.173 | 0.303 |
| 1685 | -0.073 | -0.137 | 0.289 |
| 1686 | -0.051 | -0.17 | 0.315 |
| 1687 | -0.084 | -0.137 | 0.316 |
| 1688 | -0.096 | -0.151 | 0.298 |
| 1689 | -0.131 | -0.077 | 0.253 |
| 1690 | -0.133 | -0.155 | 0.177 |
| 1691 | -0.139 | -0.272 | 0.13 |
| 1692 | -0.154 | -0.263 | 0.184 |
| 1693 | -0.104 | -0.322 | 0.286 |
| 1694 | -0.098 | -0.193 | 0.335 |
| 1695 | -0.093 | -0.218 | 0.346 |
| 1696 | -0.106 | -0.3 | 0.348 |
| 1697 | -0.15 | -0.241 | 0.355 |
| 1698 | -0.145 | -0.211 | 0.378 |
| 1699 | -0.147 | -0.257 | 0.316 |
| 1700 | -0.205 | -0.202 | 0.295 |
| 1701 | -0.186 | -0.199 | 0.361 |
| 1702 | -0.194 | -0.242 | 0.323 |
| 1703 | -0.241 | -0.184 | 0.317 |
| 1704 | -0.088 | -0.269 | 0.489 |
| 1705 | -0.224 | -0.163 | 0.415 |
| 1706 | -0.257 | -0.317 | 0.379 |
| 1707 | -0.306 | -0.303 | 0.347 |
| 1708 | -0.289 | -0.27 | 0.297 |
| 1709 | -0.306 | -0.279 | 0.277 |
| 1710 | -0.289 | -0.301 | 0.28 |
| 1711 | -0.293 | -0.313 | 0.21 |
| 1712 | -0.309 | -0.329 | 0.168 |
| 1713 | -0.286 | -0.245 | 0.232 |
| 1714 | -0.34 | -0.198 | 0.254 |
| 1715 | -0.383 | -0.13 | 0.311 |
| 1716 | -0.43 | -0.107 | 0.307 |
| 1717 | -0.458 | -0.095 | 0.342 |
| 1718 | -0.476 | -0.075 | 0.362 |
| 1719 | -0.48 | -0.128 | 0.355 |
| 1720 | -0.534 | -0.156 | 0.295 |
| 1721 | -0.57 | -0.125 | 0.245 |
| 1722 | -0.613 | -0.19 | 0.269 |
| 1723 | -0.706 | -0.19 | 0.206 |
| 1724 | -0.803 | -0.103 | 0.172 |
| 1725 | -0.862 | -0.094 | 0.173 |
| 1726 | -0.93 | -0.069 | 0.128 |
| 1727 | -0.974 | -0.014 | 0.076 |
| 1728 | -0.973 | -0.01 | 0.014 |
| 1729 | -0.936 | 0.031 | 0.01 |
| 1730 | -0.928 | 0.039 | 0.057 |
| 1731 | -0.946 | 0.02 | 0.078 |
| 1732 | -0.947 | 0.033 | 0.067 |
| 1733 | -0.909 | 0.031 | 0.088 |
| 1734 | -0.849 | 0.009 | 0.136 |
| 1735 | -0.811 | 0.027 | 0.12 |
| 1736 | -0.784 | -0.025 | 0.124 |
| 1737 | -0.724 | -0.066 | 0.214 |
| 1738 | -0.71 | -0.081 | 0.266 |
| 1739 | -0.699 | -0.031 | 0.282 |
| 1740 | -0.71 | -0.055 | 0.287 |
| 1741 | -0.77 | -0.099 | 0.173 |
| 1742 | -0.787 | -0.085 | 0.006 |
| 1743 | -0.701 | -0.122 | 0.119 |
| 1744 | -0.661 | -0.197 | 0.252 |
| 1745 | -0.604 | -0.194 | 0.196 |
| 1746 | -0.484 | -0.123 | 0.271 |
| 1747 | -0.368 | -0.104 | 0.463 |
| 1748 | -0.326 | -0.213 | 0.547 |
| 1749 | -0.292 | -0.251 | 0.486 |
| 1750 | -0.336 | -0.21 | 0.328 |
| 1751 | -0.323 | -0.176 | 0.126 |
| 1752 | -0.277 | -0.198 | 0.153 |
| 1753 | -0.227 | -0.35 | 0.254 |
| 1754 | -0.23 | -0.346 | 0.211 |
| 1755 | -0.257 | -0.273 | 0.353 |
| 1756 | -0.315 | -0.167 | 0.48 |
| 1757 | -0.35 | -0.074 | 0.446 |
| 1758 | -0.382 | -0.136 | 0.368 |
| 1759 | -0.32 | -0.215 | 0.276 |
| 1760 | -0.224 | -0.357 | 0.244 |
| 1761 | -0.149 | -0.315 | 0.315 |
| 1762 | -0.174 | -0.285 | 0.428 |
| 1763 | -0.225 | -0.211 | 0.426 |
| 1764 | -0.278 | -0.153 | 0.231 |
| 1765 | -0.212 | -0.172 | 0.162 |
| 1766 | -0.12 | -0.23 | 0.197 |
| 1767 | -0.074 | -0.177 | 0.287 |
| 1768 | -0.121 | -0.327 | 0.341 |
| 1769 | -0.238 | -0.307 | 0.297 |
| 1770 | -0.341 | -0.175 | 0.249 |
| 1771 | -0.346 | -0.065 | 0.267 |
| 1772 | -0.305 | -0.071 | 0.34 |
| 1773 | -0.18 | -0.21 | 0.31 |
| 1774 | -0.048 | -0.305 | 0.297 |
| 1775 | -0.002 | -0.203 | 0.327 |
| 1776 | -0.006 | -0.285 | 0.263 |
| 1777 | -0.061 | -0.265 | 0.307 |
| 1778 | -0.161 | -0.1 | 0.383 |
| 1779 | -0.203 | -0.149 | 0.266 |
| 1780 | -0.201 | -0.182 | 0.25 |
| 1781 | -0.19 | -0.16 | 0.315 |
| 1782 | -0.13 | -0.205 | 0.281 |
| 1783 | -0.089 | -0.235 | 0.292 |
| 1784 | 0.001 | -0.168 | 0.312 |
| 1785 | 0.059 | -0.157 | 0.311 |
| 1786 | 0.057 | -0.19 | 0.326 |
| 1787 | 0.021 | -0.192 | 0.267 |
| 1788 | 0.008 | -0.208 | 0.296 |
| 1789 | -0.022 | -0.176 | 0.298 |
| 1790 | -0.048 | -0.144 | 0.271 |
| 1791 | -0.069 | -0.156 | 0.234 |
| 1792 | -0.069 | -0.131 | 0.212 |
| 1793 | -0.043 | -0.169 | 0.226 |
| 1794 | -0.028 | -0.191 | 0.226 |
| 1795 | -0.047 | -0.194 | 0.225 |
| 1796 | -0.086 | -0.204 | 0.23 |
| 1797 | -0.129 | -0.195 | 0.22 |
| 1798 | -0.154 | -0.118 | 0.215 |
| 1799 | -0.197 | -0.155 | 0.219 |
| 1800 | -0.214 | -0.195 | 0.183 |
| 1801 | -0.223 | -0.181 | 0.187 |
| 1802 | -0.237 | -0.182 | 0.229 |
| 1803 | -0.258 | -0.181 | 0.232 |
| 1804 | -0.268 | -0.177 | 0.226 |
| 1805 | -0.286 | -0.197 | 0.23 |
| 1806 | -0.31 | -0.188 | 0.218 |
| 1807 | -0.286 | -0.205 | 0.224 |
| 1808 | -0.364 | -0.221 | 0.161 |
| 1809 | -0.373 | -0.225 | 0.153 |
| 1810 | -0.37 | -0.181 | 0.162 |
| 1811 | -0.389 | -0.182 | 0.195 |
| 1812 | -0.39 | -0.188 | 0.203 |
| 1813 | -0.388 | -0.186 | 0.183 |
| 1814 | -0.37 | -0.205 | 0.172 |
| 1815 | -0.355 | -0.193 | 0.189 |
| 1816 | -0.343 | -0.201 | 0.181 |
| 1817 | -0.335 | -0.249 | 0.173 |
| 1818 | -0.35 | -0.2 | 0.179 |
| 1819 | -0.364 | -0.154 | 0.186 |
| 1820 | -0.352 | -0.164 | 0.178 |
| 1821 | -0.334 | -0.181 | 0.168 |
| 1822 | -0.316 | -0.179 | 0.176 |
| 1823 | -0.314 | -0.168 | 0.178 |
| 1824 | -0.291 | -0.158 | 0.189 |
| 1825 | -0.285 | -0.181 | 0.208 |
| 1826 | -0.29 | -0.183 | 0.19 |
| 1827 | -0.293 | -0.18 | 0.188 |
| 1828 | -0.289 | -0.18 | 0.177 |
| 1829 | -0.286 | -0.181 | 0.164 |
| 1830 | -0.275 | -0.176 | 0.165 |
| 1831 | -0.256 | -0.167 | 0.166 |
| 1832 | -0.24 | -0.159 | 0.181 |
| 1833 | -0.242 | -0.15 | 0.176 |
| 1834 | -0.237 | -0.167 | 0.157 |
| 1835 | -0.23 | -0.156 | 0.148 |
| 1836 | -0.232 | -0.13 | 0.149 |
| 1837 | -0.231 | -0.152 | 0.133 |
| 1838 | -0.223 | -0.148 | 0.113 |
| 1839 | -0.208 | -0.133 | 0.134 |
| 1840 | -0.202 | -0.109 | 0.139 |
| 1841 | -0.201 | -0.125 | 0.122 |
| 1842 | -0.202 | -0.153 | 0.128 |
| 1843 | -0.224 | -0.126 | 0.117 |
| 1844 | -0.231 | -0.111 | 0.119 |
| 1845 | -0.234 | -0.117 | 0.124 |
| 1846 | -0.246 | -0.128 | 0.115 |
| 1847 | -0.248 | -0.127 | 0.106 |
| 1848 | -0.236 | -0.137 | 0.095 |
| 1849 | -0.238 | -0.112 | 0.099 |
| 1850 | -0.248 | -0.102 | 0.112 |
| 1851 | -0.247 | -0.135 | 0.097 |
| 1852 | -0.245 | -0.114 | 0.091 |
| 1853 | -0.232 | -0.103 | 0.094 |
| 1854 | -0.204 | -0.121 | 0.08 |
| 1855 | -0.198 | -0.103 | 0.082 |
| 1856 | -0.205 | -0.1 | 0.082 |
| 1857 | -0.197 | -0.106 | 0.078 |
| 1858 | -0.183 | -0.093 | 0.087 |
| 1859 | -0.181 | -0.084 | 0.084 |
| 1860 | -0.18 | -0.107 | 0.072 |
| 1861 | -0.175 | -0.102 | 0.058 |
| 1862 | -0.167 | -0.073 | 0.068 |
| 1863 | -0.163 | -0.074 | 0.081 |
| 1864 | -0.161 | -0.085 | 0.06 |
| 1865 | -0.147 | -0.088 | 0.058 |
| 1866 | -0.124 | -0.067 | 0.072 |
| 1867 | -0.12 | -0.061 | 0.071 |
| 1868 | -0.114 | -0.09 | 0.061 |
| 1869 | -0.112 | -0.074 | 0.05 |
| 1870 | -0.11 | -0.054 | 0.062 |
| 1871 | -0.122 | -0.049 | 0.066 |
| 1872 | -0.099 | -0.071 | 0.06 |
| 1873 | -0.093 | -0.065 | 0.051 |
| 1874 | -0.093 | -0.061 | 0.058 |
| 1875 | -0.082 | -0.085 | 0.056 |
| 1876 | -0.056 | -0.066 | 0.057 |
| 1877 | -0.087 | -0.038 | 0.037 |
| 1878 | -0.092 | -0.056 | 0.048 |
| 1879 | -0.083 | -0.048 | 0.045 |
| 1880 | -0.095 | -0.05 | 0.057 |
| 1881 | -0.085 | -0.058 | 0.066 |
| 1882 | -0.072 | -0.049 | 0.059 |
| 1883 | -0.071 | -0.045 | 0.059 |
| 1884 | -0.07 | -0.042 | 0.05 |
| 1885 | -0.085 | -0.05 | 0.047 |
| 1886 | -0.081 | -0.053 | 0.032 |
| 1887 | -0.132 | -0.017 | 0.04 |
| 1888 | -0.227 | -0.02 | -0.003 |
| 1889 | 0.052 | -0.124 | 0.079 |
| 1890 | -0.025 | -0.017 | -0.036 |
| 1891 | -0.04 | -0.148 | 0.007 |
| 1892 | -0.128 | 0.022 | 0.115 |
| 1893 | -0.098 | 0.04 | 0.116 |
| 1894 | -0.076 | -0.066 | 0.022 |
| 1895 | -0.07 | -0.056 | 0.021 |
| 1896 | -0.098 | -0.011 | 0.059 |
| 1897 | -0.101 | -0.034 | 0.049 |
| 1898 | -0.114 | -0.066 | 0.042 |
| 1899 | -0.119 | -0.061 | 0.044 |
| 1900 | -0.081 | -0.072 | 0.007 |
| 1901 | -0.082 | -0.057 | 0.031 |
| 1902 | -0.096 | -0.033 | 0.044 |
| 1903 | -0.067 | -0.04 | 0.045 |
| 1904 | -0.069 | -0.034 | 0.072 |
| 1905 | -0.077 | -0.033 | 0.066 |
| 1906 | -0.085 | -0.052 | 0.036 |
| 1907 | -0.097 | -0.059 | 0.034 |
| 1908 | -0.113 | -0.04 | 0.048 |
| 1909 | -0.104 | -0.04 | 0.041 |
| 1910 | -0.11 | -0.044 | 0.035 |
| 1911 | -0.079 | -0.062 | 0.012 |
| 1912 | -0.056 | -0.049 | 0.035 |
| 1913 | -0.074 | -0.041 | 0.06 |
| 1914 | -0.071 | -0.05 | 0.047 |
| 1915 | -0.081 | -0.037 | 0.049 |
| 1916 | -0.099 | -0.043 | 0.052 |
| 1917 | -0.078 | -0.061 | 0.033 |
| 1918 | -0.074 | -0.045 | 0.042 |
| 1919 | -0.055 | -0.028 | 0.066 |
| 1920 | -0.061 | -0.019 | 0.053 |
| 1921 | -0.048 | -0.022 | 0.02 |
| 1922 | -0.051 | -0.047 | 0.003 |
| 1923 | -0.048 | -0.069 | 0.042 |
| 1924 | -0.05 | -0.059 | 0.059 |
| 1925 | -0.054 | -0.047 | 0.029 |
| 1926 | -0.043 | -0.068 | 0.04 |
| 1927 | -0.096 | -0.042 | 0.085 |
| 1928 | -0.104 | -0.012 | 0.057 |
| 1929 | -0.066 | -0.032 | 0.028 |
| 1930 | -0.07 | -0.04 | 0.018 |
| 1931 | -0.081 | -0.018 | 0.042 |
| 1932 | -0.084 | -0.007 | 0.058 |
| 1933 | -0.077 | -0.027 | 0.048 |
| 1934 | -0.077 | -0.039 | 0.047 |
| 1935 | -0.082 | -0.03 | 0.045 |
| 1936 | -0.083 | -0.016 | 0.045 |
| 1937 | -0.092 | -0.017 | 0.057 |
| 1938 | -0.099 | -0.021 | 0.034 |
| 1939 | -0.06 | -0.046 | -0.013 |
| 1940 | -0.044 | -0.065 | -0.007 |
| 1941 | -0.065 | -0.034 | 0.015 |
| 1942 | -0.065 | -0.011 | 0.022 |
| 1943 | -0.048 | -0.029 | 0.033 |
| 1944 | -0.037 | -0.041 | 0.054 |
| 1945 | -0.041 | -0.027 | 0.071 |
| 1946 | -0.058 | -0.026 | 0.068 |
| 1947 | -0.069 | -0.04 | 0.062 |
| 1948 | -0.114 | -0.029 | 0.043 |
| 1949 | -0.15 | -0.026 | 0.004 |
| 1950 | -0.094 | -0.062 | -0.031 |
| 1951 | -0.003 | -0.069 | -0.032 |
| 1952 | 0.002 | -0.046 | 0.046 |
| 1953 | -0.071 | -0.001 | 0.088 |
| 1954 | -0.069 | 0.01 | 0.067 |
| 1955 | -0.062 | -0.051 | 0.046 |
| 1956 | -0.077 | -0.035 | 0.046 |
| 1957 | -0.061 | -0.028 | 0.041 |
| 1958 | -0.047 | -0.053 | 0.04 |
| 1959 | -0.063 | -0.033 | 0.037 |
| 1960 | -0.071 | -0.015 | 0.029 |
| 1961 | -0.066 | -0.032 | 0.028 |
| 1962 | -0.06 | -0.036 | 0.036 |
| 1963 | -0.06 | -0.028 | 0.034 |
| 1964 | -0.06 | -0.036 | 0.027 |
| 1965 | -0.053 | -0.044 | 0.023 |
| 1966 | -0.052 | -0.03 | 0.034 |
| 1967 | -0.076 | -0.021 | 0.034 |
| 1968 | -0.063 | -0.031 | 0.023 |
| 1969 | -0.049 | -0.043 | 0.023 |
| 1970 | -0.051 | -0.048 | 0.03 |
| 1971 | -0.041 | -0.045 | 0.038 |
| 1972 | -0.049 | -0.033 | 0.049 |
| 1973 | -0.059 | -0.017 | 0.044 |
| 1974 | -0.062 | -0.005 | 0.033 |
| 1975 | -0.053 | -0.027 | 0.034 |
| 1976 | -0.039 | -0.033 | 0.036 |
| 1977 | -0.038 | -0.03 | 0.032 |
| 1978 | -0.04 | -0.028 | 0.04 |
| 1979 | -0.039 | -0.02 | 0.031 |
| 1980 | -0.038 | -0.018 | 0.033 |
| 1981 | -0.052 | -0.02 | 0.039 |
| 1982 | -0.048 | -0.03 | 0.03 |
| 1983 | -0.044 | -0.035 | 0.025 |
| 1984 | -0.055 | -0.031 | 0.023 |
| 1985 | -0.054 | -0.026 | 0.019 |
| 1986 | -0.045 | -0.017 | 0.028 |
| 1987 | -0.043 | -0.009 | 0.021 |
| 1988 | -0.035 | -0.024 | 0.023 |
| 1989 | -0.042 | -0.022 | 0.029 |
| 1990 | -0.046 | -0.021 | 0.014 |
| 1991 | -0.047 | -0.032 | 0.01 |
| 1992 | -0.041 | -0.03 | 0.027 |
| 1993 | -0.049 | -0.005 | 0.03 |
| 1994 | -0.053 | -0.006 | 0.027 |
| 1995 | -0.052 | -0.023 | 0.018 |
| 1996 | -0.051 | -0.031 | 0.009 |
| 1997 | -0.042 | -0.023 | 0.004 |
| 1998 | -0.031 | -0.028 | 0.015 |
| 1999 | -0.026 | -0.028 | 0.031 |
| 2000 | -0.029 | -0.015 | 0.048 |
| 2001 | -0.029 | -0.02 | 0.044 |
| 2002 | -0.022 | -0.017 | 0.033 |
| 2003 | -0.021 | -0.022 | 0.023 |
| 2004 | -0.01 | -0.025 | 0.02 |
| 2005 | -0.004 | -0.022 | 0.023 |
| 2006 | -0.01 | -0.005 | 0.032 |
| 2007 | 0.017 | -0.016 | 0.056 |
| 2008 | -0.052 | -0.007 | 0.002 |
| 2009 | -0.063 | -0.048 | 0.02 |
| 2010 | -0.023 | -0.029 | 0.02 |
| 2011 | -0.061 | -0.025 | 0.005 |
| 2012 | -0.056 | -0.031 | 0.021 |
| 2013 | -0.049 | -0.02 | 0.03 |
| 2014 | -0.04 | -0.009 | 0.044 |
| 2015 | -0.04 | -0.009 | 0.028 |
| 2016 | -0.046 | -0.021 | 0.017 |
| 2017 | -0.048 | -0.043 | 0.017 |
| 2018 | -0.061 | -0.038 | 0.009 |
| 2019 | -0.09 | 0.004 | 0.012 |
| 2020 | -0.061 | 0.009 | 0.026 |
| 2021 | -0.036 | -0.011 | 0.042 |
| 2022 | -0.041 | -0.037 | 0.035 |
| 2023 | -0.031 | -0.036 | 0.033 |
| 2024 | -0.034 | -0.026 | 0.033 |
| 2025 | -0.042 | -0.017 | 0.039 |
| 2026 | -0.039 | -0.022 | 0.038 |
| 2027 | -0.039 | -0.019 | 0.011 |
| 2028 | -0.03 | -0.012 | 0.017 |
| 2029 | -0.014 | -0.034 | 0.032 |
| 2030 | -0.023 | -0.032 | 0.011 |
| 2031 | -0.015 | -0.032 | 0.023 |
| 2032 | -0.012 | -0.023 | 0.025 |
| 2033 | -0.036 | -0.012 | 0.012 |
| 2034 | -0.029 | -0.008 | 0.021 |
| 2035 | -0.03 | -0.009 | 0.019 |
| 2036 | -0.02 | -0.018 | 0.022 |
| 2037 | -0.008 | -0.028 | 0.045 |
| 2038 | -0.018 | -0.028 | 0.054 |
| 2039 | -0.028 | -0.018 | 0.032 |
| 2040 | -0.035 | -0.007 | 0.028 |
| 2041 | -0.049 | -0.016 | 0.025 |
| 2042 | -0.05 | -0.017 | 0.024 |
| 2043 | -0.046 | -0.031 | 0.017 |
| 2044 | -0.052 | -0.025 | 0.014 |
| 2045 | -0.051 | -0.023 | 0.014 |
| 2046 | -0.047 | -0.027 | 0.014 |
| 2047 | -0.051 | -0.029 | 0.016 |
| 2048 | -0.051 | -0.019 | 0.022 |
| 2049 | -0.044 | -0.01 | 0.019 |
| 2050 | -0.028 | -0.021 | 0.011 |
| 2051 | -0.02 | -0.022 | 0.022 |
| 2052 | -0.017 | -0.023 | 0.024 |
| 2053 | -0.019 | -0.023 | 0.017 |
| 2054 | -0.023 | -0.026 | 0.027 |
| 2055 | -0.03 | -0.016 | 0.04 |
| 2056 | -0.04 | -0.009 | 0.026 |
| 2057 | -0.037 | -0.014 | 0.026 |
| 2058 | -0.031 | -0.022 | 0.027 |
| 2059 | -0.035 | -0.025 | 0.016 |
| 2060 | -0.034 | -0.018 | 0.023 |
| 2061 | -0.03 | -0.015 | 0.025 |
| 2062 | -0.032 | -0.009 | 0.017 |
| 2063 | -0.032 | -0.01 | 0.028 |
| 2064 | -0.051 | -0.009 | 0.019 |
| 2065 | -0.035 | -0.028 | 0.001 |
| 2066 | -0.015 | -0.037 | 0.017 |
| 2067 | -0.036 | -0.014 | 0.015 |
| 2068 | -0.028 | -0.019 | 0.023 |
| 2069 | -0.033 | -0.036 | 0.018 |
| 2070 | -0.033 | -0.013 | 0.024 |
| 2071 | -0.03 | -0.015 | 0.023 |
| 2072 | -0.044 | -0.028 | 0.019 |
| 2073 | -0.034 | -0.012 | 0.029 |
| 2074 | -0.029 | 0.001 | 0.032 |
| 2075 | -0.031 | -0.011 | 0.034 |
| 2076 | -0.026 | -0.028 | 0.024 |
| 2077 | -0.033 | -0.033 | 0.02 |
| 2078 | -0.042 | -0.025 | 0.017 |
| 2079 | -0.032 | -0.008 | 0.023 |
| 2080 | -0.026 | -0.014 | 0.018 |
| 2081 | -0.033 | -0.024 | 0.015 |
| 2082 | -0.033 | -0.016 | 0.026 |
| 2083 | -0.021 | -0.023 | 0.018 |
| 2084 | -0.027 | -0.019 | 0.006 |
| 2085 | -0.027 | -0.018 | 0.021 |
| 2086 | -0.026 | -0.016 | 0.032 |
| 2087 | -0.022 | -0.011 | 0.018 |
| 2088 | -0.015 | -0.021 | 0.004 |
| 2089 | -0.014 | -0.022 | 0.011 |
| 2090 | -0.016 | -0.015 | 0.019 |
| 2091 | -0.01 | -0.02 | 0.018 |
| 2092 | 0.003 | -0.028 | 0.017 |
| 2093 | -0.006 | -0.003 | 0.031 |
| 2094 | -0.009 | -0.002 | 0.04 |
| 2095 | -0.007 | -0.017 | 0.028 |
| 2096 | -0.011 | -0.015 | 0.035 |
| 2097 | -0.018 | -0.017 | 0.03 |
| 2098 | -0.028 | -0.02 | 0.018 |
| 2099 | -0.04 | -0.013 | 0.024 |
| 2100 | -0.048 | -0.017 | 0.019 |
| 2101 | -0.045 | -0.013 | 0.011 |
| 2102 | -0.034 | -0.015 | 0.018 |
| 2103 | -0.032 | -0.017 | 0.024 |
| 2104 | -0.038 | -0.022 | 0.021 |
| 2105 | -0.03 | -0.028 | 0.014 |
| 2106 | -0.025 | -0.011 | 0.016 |
| 2107 | -0.03 | -0.006 | 0.031 |
| 2108 | -0.026 | -0.01 | 0.025 |
| 2109 | -0.015 | -0.019 | 0.029 |
| 2110 | -0.01 | -0.016 | 0.026 |
| 2111 | -0.016 | -0.018 | 0.018 |
| 2112 | -0.02 | -0.022 | 0.012 |
| 2113 | -0.027 | -0.022 | 0.019 |
| 2114 | -0.032 | -0.016 | 0.021 |
| 2115 | -0.029 | -0.01 | 0.021 |
| 2116 | -0.035 | -0.014 | 0.018 |
| 2117 | -0.032 | -0.018 | 0.02 |
| 2118 | -0.025 | -0.009 | 0.032 |
| 2119 | -0.022 | -0.013 | 0.03 |
| 2120 | -0.024 | -0.019 | 0.01 |
| 2121 | -0.021 | -0.021 | 0.01 |
| 2122 | -0.022 | -0.017 | 0.025 |
| 2123 | -0.022 | -0.013 | 0.032 |
| 2124 | -0.024 | -0.015 | 0.028 |
| 2125 | -0.029 | -0.017 | 0.019 |
| 2126 | -0.027 | -0.01 | 0.016 |
| 2127 | -0.027 | 0 | 0.031 |
| 2128 | -0.028 | -0.01 | 0.024 |
| 2129 | -0.027 | -0.023 | 0.015 |
| 2130 | -0.03 | -0.019 | 0.013 |
| 2131 | -0.023 | -0.016 | 0.005 |
| 2132 | -0.015 | -0.022 | 0.011 |
| 2133 | -0.017 | -0.025 | 0.018 |
| 2134 | -0.012 | -0.024 | 0.021 |
| 2135 | -0.01 | -0.015 | 0.042 |
| 2136 | -0.014 | -0.011 | 0.048 |
| 2137 | -0.016 | -0.007 | 0.031 |
| 2138 | -0.029 | -0.008 | 0.016 |
| 2139 | -0.035 | -0.014 | 0.021 |
| 2140 | -0.037 | -0.026 | 0.006 |
| 2141 | -0.039 | -0.026 | 0.001 |
| 2142 | -0.028 | -0.014 | 0.016 |
| 2143 | -0.028 | -0.013 | 0.013 |
| 2144 | -0.029 | -0.022 | 0.02 |
| 2145 | -0.025 | -0.013 | 0.025 |
| 2146 | -0.024 | -0.009 | 0.019 |
| 2147 | -0.027 | -0.011 | 0.026 |
| 2148 | -0.028 | -0.012 | 0.024 |
| 2149 | -0.029 | -0.018 | 0.017 |
| 2150 | -0.029 | -0.014 | 0.016 |
| 2151 | -0.03 | -0.011 | 0.027 |
| 2152 | -0.031 | -0.013 | 0.028 |
| 2153 | -0.034 | -0.011 | 0.017 |
| 2154 | -0.034 | -0.016 | 0.021 |
| 2155 | -0.029 | -0.023 | 0.024 |
| 2156 | -0.032 | -0.019 | 0.014 |
| 2157 | -0.034 | -0.018 | 0.007 |
| 2158 | -0.036 | -0.013 | 0.008 |
| 2159 | -0.036 | -0.01 | 0.012 |
| 2160 | -0.035 | -0.015 | 0.019 |
| 2161 | -0.034 | -0.02 | 0.011 |
| 2162 | -0.032 | -0.022 | 0.011 |
| 2163 | -0.026 | -0.024 | 0.013 |
| 2164 | -0.02 | -0.027 | 0.011 |
| 2165 | -0.018 | -0.013 | 0.017 |
| 2166 | -0.018 | -0.011 | 0.022 |
| 2167 | -0.013 | -0.018 | 0.025 |
| 2168 | -0.016 | -0.014 | 0.025 |
| 2169 | -0.011 | -0.012 | 0.031 |
| 2170 | -0.003 | -0.012 | 0.032 |
| 2171 | 0.002 | -0.011 | 0.039 |
| 2172 | 0.007 | -0.013 | 0.034 |
| 2173 | 0.004 | -0.009 | 0.028 |
| 2174 | 0.001 | -0.014 | 0.039 |
| 2175 | 0.005 | -0.016 | 0.038 |
| 2176 | 0.002 | -0.004 | 0.032 |
| 2177 | 0.002 | -0.008 | 0.032 |
| 2178 | 0.003 | -0.011 | 0.026 |
| 2179 | -0.001 | -0.018 | 0.023 |
| 2180 | -0.01 | -0.027 | 0.018 |
| 2181 | -0.031 | -0.021 | 0.004 |
| 2182 | -0.044 | -0.021 | 0.002 |
| 2183 | -0.05 | -0.026 | -0.001 |
| 2184 | -0.051 | -0.015 | -0.003 |
| 2185 | -0.045 | -0.016 | 0.02 |
| 2186 | -0.043 | -0.021 | 0.014 |
| 2187 | -0.042 | -0.023 | 0.01 |
| 2188 | -0.032 | -0.017 | 0.029 |